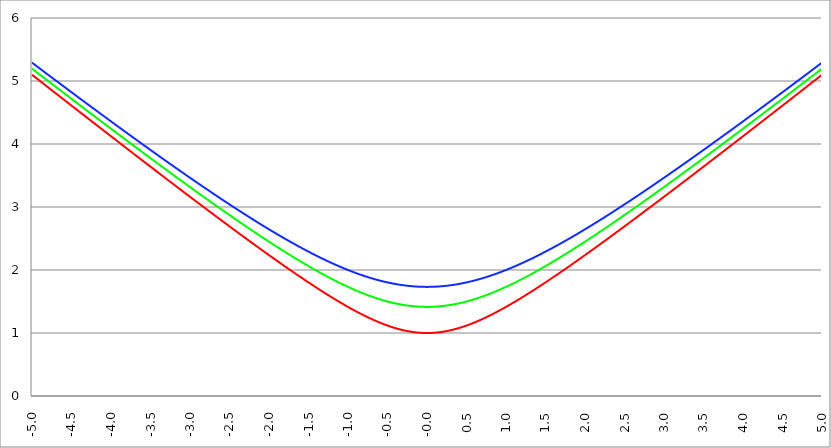
| Category | Series 1 | Series 0 | Series 2 |
|---|---|---|---|
| -5.0 | 5.099 | 5.196 | 5.292 |
| -4.995 | 5.094 | 5.191 | 5.287 |
| -4.99 | 5.089 | 5.187 | 5.282 |
| -4.985 | 5.084 | 5.182 | 5.277 |
| -4.98 | 5.079 | 5.177 | 5.273 |
| -4.975 | 5.075 | 5.172 | 5.268 |
| -4.97 | 5.07 | 5.167 | 5.263 |
| -4.965000000000001 | 5.065 | 5.162 | 5.258 |
| -4.960000000000001 | 5.06 | 5.158 | 5.254 |
| -4.955000000000001 | 5.055 | 5.153 | 5.249 |
| -4.950000000000001 | 5.05 | 5.148 | 5.244 |
| -4.945000000000001 | 5.045 | 5.143 | 5.24 |
| -4.940000000000001 | 5.04 | 5.138 | 5.235 |
| -4.935000000000001 | 5.035 | 5.134 | 5.23 |
| -4.930000000000001 | 5.03 | 5.129 | 5.225 |
| -4.925000000000002 | 5.025 | 5.124 | 5.221 |
| -4.920000000000002 | 5.021 | 5.119 | 5.216 |
| -4.915000000000002 | 5.016 | 5.114 | 5.211 |
| -4.910000000000002 | 5.011 | 5.11 | 5.207 |
| -4.905000000000002 | 5.006 | 5.105 | 5.202 |
| -4.900000000000002 | 5.001 | 5.1 | 5.197 |
| -4.895000000000002 | 4.996 | 5.095 | 5.192 |
| -4.890000000000002 | 4.991 | 5.09 | 5.188 |
| -4.885000000000002 | 4.986 | 5.086 | 5.183 |
| -4.880000000000002 | 4.981 | 5.081 | 5.178 |
| -4.875000000000003 | 4.977 | 5.076 | 5.174 |
| -4.870000000000003 | 4.972 | 5.071 | 5.169 |
| -4.865000000000003 | 4.967 | 5.066 | 5.164 |
| -4.860000000000003 | 4.962 | 5.062 | 5.159 |
| -4.855000000000003 | 4.957 | 5.057 | 5.155 |
| -4.850000000000003 | 4.952 | 5.052 | 5.15 |
| -4.845000000000003 | 4.947 | 5.047 | 5.145 |
| -4.840000000000003 | 4.942 | 5.042 | 5.141 |
| -4.835000000000003 | 4.937 | 5.038 | 5.136 |
| -4.830000000000004 | 4.932 | 5.033 | 5.131 |
| -4.825000000000004 | 4.928 | 5.028 | 5.126 |
| -4.820000000000004 | 4.923 | 5.023 | 5.122 |
| -4.815000000000004 | 4.918 | 5.018 | 5.117 |
| -4.810000000000004 | 4.913 | 5.014 | 5.112 |
| -4.805000000000004 | 4.908 | 5.009 | 5.108 |
| -4.800000000000004 | 4.903 | 5.004 | 5.103 |
| -4.795000000000004 | 4.898 | 4.999 | 5.098 |
| -4.790000000000004 | 4.893 | 4.994 | 5.094 |
| -4.785000000000004 | 4.888 | 4.99 | 5.089 |
| -4.780000000000004 | 4.883 | 4.985 | 5.084 |
| -4.775000000000004 | 4.879 | 4.98 | 5.079 |
| -4.770000000000004 | 4.874 | 4.975 | 5.075 |
| -4.765000000000005 | 4.869 | 4.97 | 5.07 |
| -4.760000000000005 | 4.864 | 4.966 | 5.065 |
| -4.755000000000005 | 4.859 | 4.961 | 5.061 |
| -4.750000000000005 | 4.854 | 4.956 | 5.056 |
| -4.745000000000005 | 4.849 | 4.951 | 5.051 |
| -4.740000000000005 | 4.844 | 4.946 | 5.047 |
| -4.735000000000005 | 4.839 | 4.942 | 5.042 |
| -4.730000000000005 | 4.835 | 4.937 | 5.037 |
| -4.725000000000006 | 4.83 | 4.932 | 5.032 |
| -4.720000000000006 | 4.825 | 4.927 | 5.028 |
| -4.715000000000006 | 4.82 | 4.923 | 5.023 |
| -4.710000000000006 | 4.815 | 4.918 | 5.018 |
| -4.705000000000006 | 4.81 | 4.913 | 5.014 |
| -4.700000000000006 | 4.805 | 4.908 | 5.009 |
| -4.695000000000006 | 4.8 | 4.903 | 5.004 |
| -4.690000000000006 | 4.795 | 4.899 | 5 |
| -4.685000000000007 | 4.791 | 4.894 | 4.995 |
| -4.680000000000007 | 4.786 | 4.889 | 4.99 |
| -4.675000000000007 | 4.781 | 4.884 | 4.986 |
| -4.670000000000007 | 4.776 | 4.879 | 4.981 |
| -4.665000000000007 | 4.771 | 4.875 | 4.976 |
| -4.660000000000007 | 4.766 | 4.87 | 4.971 |
| -4.655000000000007 | 4.761 | 4.865 | 4.967 |
| -4.650000000000007 | 4.756 | 4.86 | 4.962 |
| -4.645000000000007 | 4.751 | 4.856 | 4.957 |
| -4.640000000000008 | 4.747 | 4.851 | 4.953 |
| -4.635000000000008 | 4.742 | 4.846 | 4.948 |
| -4.630000000000008 | 4.737 | 4.841 | 4.943 |
| -4.625000000000008 | 4.732 | 4.836 | 4.939 |
| -4.620000000000008 | 4.727 | 4.832 | 4.934 |
| -4.615000000000008 | 4.722 | 4.827 | 4.929 |
| -4.610000000000008 | 4.717 | 4.822 | 4.925 |
| -4.605000000000008 | 4.712 | 4.817 | 4.92 |
| -4.600000000000008 | 4.707 | 4.812 | 4.915 |
| -4.595000000000009 | 4.703 | 4.808 | 4.911 |
| -4.590000000000009 | 4.698 | 4.803 | 4.906 |
| -4.585000000000009 | 4.693 | 4.798 | 4.901 |
| -4.580000000000009 | 4.688 | 4.793 | 4.897 |
| -4.57500000000001 | 4.683 | 4.789 | 4.892 |
| -4.57000000000001 | 4.678 | 4.784 | 4.887 |
| -4.565000000000009 | 4.673 | 4.779 | 4.883 |
| -4.560000000000009 | 4.668 | 4.774 | 4.878 |
| -4.555000000000009 | 4.663 | 4.769 | 4.873 |
| -4.55000000000001 | 4.659 | 4.765 | 4.869 |
| -4.54500000000001 | 4.654 | 4.76 | 4.864 |
| -4.54000000000001 | 4.649 | 4.755 | 4.859 |
| -4.53500000000001 | 4.644 | 4.75 | 4.855 |
| -4.53000000000001 | 4.639 | 4.746 | 4.85 |
| -4.52500000000001 | 4.634 | 4.741 | 4.845 |
| -4.52000000000001 | 4.629 | 4.736 | 4.84 |
| -4.51500000000001 | 4.624 | 4.731 | 4.836 |
| -4.51000000000001 | 4.62 | 4.727 | 4.831 |
| -4.505000000000011 | 4.615 | 4.722 | 4.826 |
| -4.500000000000011 | 4.61 | 4.717 | 4.822 |
| -4.495000000000011 | 4.605 | 4.712 | 4.817 |
| -4.490000000000011 | 4.6 | 4.707 | 4.812 |
| -4.485000000000011 | 4.595 | 4.703 | 4.808 |
| -4.480000000000011 | 4.59 | 4.698 | 4.803 |
| -4.475000000000011 | 4.585 | 4.693 | 4.799 |
| -4.470000000000011 | 4.58 | 4.688 | 4.794 |
| -4.465000000000011 | 4.576 | 4.684 | 4.789 |
| -4.460000000000011 | 4.571 | 4.679 | 4.785 |
| -4.455000000000012 | 4.566 | 4.674 | 4.78 |
| -4.450000000000012 | 4.561 | 4.669 | 4.775 |
| -4.445000000000012 | 4.556 | 4.665 | 4.771 |
| -4.440000000000012 | 4.551 | 4.66 | 4.766 |
| -4.435000000000012 | 4.546 | 4.655 | 4.761 |
| -4.430000000000012 | 4.541 | 4.65 | 4.757 |
| -4.425000000000012 | 4.537 | 4.645 | 4.752 |
| -4.420000000000012 | 4.532 | 4.641 | 4.747 |
| -4.415000000000012 | 4.527 | 4.636 | 4.743 |
| -4.410000000000013 | 4.522 | 4.631 | 4.738 |
| -4.405000000000013 | 4.517 | 4.626 | 4.733 |
| -4.400000000000013 | 4.512 | 4.622 | 4.729 |
| -4.395000000000013 | 4.507 | 4.617 | 4.724 |
| -4.390000000000013 | 4.502 | 4.612 | 4.719 |
| -4.385000000000013 | 4.498 | 4.607 | 4.715 |
| -4.380000000000013 | 4.493 | 4.603 | 4.71 |
| -4.375000000000013 | 4.488 | 4.598 | 4.705 |
| -4.370000000000013 | 4.483 | 4.593 | 4.701 |
| -4.365000000000013 | 4.478 | 4.588 | 4.696 |
| -4.360000000000014 | 4.473 | 4.584 | 4.691 |
| -4.355000000000014 | 4.468 | 4.579 | 4.687 |
| -4.350000000000014 | 4.463 | 4.574 | 4.682 |
| -4.345000000000014 | 4.459 | 4.569 | 4.678 |
| -4.340000000000014 | 4.454 | 4.565 | 4.673 |
| -4.335000000000014 | 4.449 | 4.56 | 4.668 |
| -4.330000000000014 | 4.444 | 4.555 | 4.664 |
| -4.325000000000014 | 4.439 | 4.55 | 4.659 |
| -4.320000000000014 | 4.434 | 4.546 | 4.654 |
| -4.315000000000015 | 4.429 | 4.541 | 4.65 |
| -4.310000000000015 | 4.424 | 4.536 | 4.645 |
| -4.305000000000015 | 4.42 | 4.531 | 4.64 |
| -4.300000000000015 | 4.415 | 4.527 | 4.636 |
| -4.295000000000015 | 4.41 | 4.522 | 4.631 |
| -4.290000000000015 | 4.405 | 4.517 | 4.626 |
| -4.285000000000015 | 4.4 | 4.512 | 4.622 |
| -4.280000000000015 | 4.395 | 4.508 | 4.617 |
| -4.275000000000015 | 4.39 | 4.503 | 4.613 |
| -4.270000000000015 | 4.386 | 4.498 | 4.608 |
| -4.265000000000016 | 4.381 | 4.493 | 4.603 |
| -4.260000000000016 | 4.376 | 4.489 | 4.599 |
| -4.255000000000016 | 4.371 | 4.484 | 4.594 |
| -4.250000000000016 | 4.366 | 4.479 | 4.589 |
| -4.245000000000016 | 4.361 | 4.474 | 4.585 |
| -4.240000000000016 | 4.356 | 4.47 | 4.58 |
| -4.235000000000016 | 4.351 | 4.465 | 4.576 |
| -4.230000000000016 | 4.347 | 4.46 | 4.571 |
| -4.225000000000017 | 4.342 | 4.455 | 4.566 |
| -4.220000000000017 | 4.337 | 4.451 | 4.562 |
| -4.215000000000017 | 4.332 | 4.446 | 4.557 |
| -4.210000000000017 | 4.327 | 4.441 | 4.552 |
| -4.205000000000017 | 4.322 | 4.436 | 4.548 |
| -4.200000000000017 | 4.317 | 4.432 | 4.543 |
| -4.195000000000017 | 4.313 | 4.427 | 4.539 |
| -4.190000000000017 | 4.308 | 4.422 | 4.534 |
| -4.185000000000017 | 4.303 | 4.417 | 4.529 |
| -4.180000000000017 | 4.298 | 4.413 | 4.525 |
| -4.175000000000018 | 4.293 | 4.408 | 4.52 |
| -4.170000000000018 | 4.288 | 4.403 | 4.515 |
| -4.165000000000018 | 4.283 | 4.399 | 4.511 |
| -4.160000000000018 | 4.279 | 4.394 | 4.506 |
| -4.155000000000018 | 4.274 | 4.389 | 4.502 |
| -4.150000000000018 | 4.269 | 4.384 | 4.497 |
| -4.145000000000018 | 4.264 | 4.38 | 4.492 |
| -4.140000000000018 | 4.259 | 4.375 | 4.488 |
| -4.135000000000018 | 4.254 | 4.37 | 4.483 |
| -4.130000000000019 | 4.249 | 4.365 | 4.478 |
| -4.125000000000019 | 4.244 | 4.361 | 4.474 |
| -4.120000000000019 | 4.24 | 4.356 | 4.469 |
| -4.115000000000019 | 4.235 | 4.351 | 4.465 |
| -4.110000000000019 | 4.23 | 4.347 | 4.46 |
| -4.105000000000019 | 4.225 | 4.342 | 4.455 |
| -4.100000000000019 | 4.22 | 4.337 | 4.451 |
| -4.095000000000019 | 4.215 | 4.332 | 4.446 |
| -4.090000000000019 | 4.21 | 4.328 | 4.442 |
| -4.085000000000019 | 4.206 | 4.323 | 4.437 |
| -4.08000000000002 | 4.201 | 4.318 | 4.432 |
| -4.07500000000002 | 4.196 | 4.313 | 4.428 |
| -4.07000000000002 | 4.191 | 4.309 | 4.423 |
| -4.06500000000002 | 4.186 | 4.304 | 4.419 |
| -4.06000000000002 | 4.181 | 4.299 | 4.414 |
| -4.05500000000002 | 4.176 | 4.295 | 4.409 |
| -4.05000000000002 | 4.172 | 4.29 | 4.405 |
| -4.04500000000002 | 4.167 | 4.285 | 4.4 |
| -4.04000000000002 | 4.162 | 4.28 | 4.396 |
| -4.03500000000002 | 4.157 | 4.276 | 4.391 |
| -4.03000000000002 | 4.152 | 4.271 | 4.386 |
| -4.025000000000021 | 4.147 | 4.266 | 4.382 |
| -4.020000000000021 | 4.143 | 4.262 | 4.377 |
| -4.015000000000021 | 4.138 | 4.257 | 4.373 |
| -4.010000000000021 | 4.133 | 4.252 | 4.368 |
| -4.005000000000021 | 4.128 | 4.247 | 4.363 |
| -4.000000000000021 | 4.123 | 4.243 | 4.359 |
| -3.995000000000021 | 4.118 | 4.238 | 4.354 |
| -3.990000000000021 | 4.113 | 4.233 | 4.35 |
| -3.985000000000022 | 4.109 | 4.229 | 4.345 |
| -3.980000000000022 | 4.104 | 4.224 | 4.341 |
| -3.975000000000022 | 4.099 | 4.219 | 4.336 |
| -3.970000000000022 | 4.094 | 4.214 | 4.331 |
| -3.965000000000022 | 4.089 | 4.21 | 4.327 |
| -3.960000000000022 | 4.084 | 4.205 | 4.322 |
| -3.955000000000022 | 4.079 | 4.2 | 4.318 |
| -3.950000000000022 | 4.075 | 4.196 | 4.313 |
| -3.945000000000022 | 4.07 | 4.191 | 4.308 |
| -3.940000000000023 | 4.065 | 4.186 | 4.304 |
| -3.935000000000023 | 4.06 | 4.181 | 4.299 |
| -3.930000000000023 | 4.055 | 4.177 | 4.295 |
| -3.925000000000023 | 4.05 | 4.172 | 4.29 |
| -3.920000000000023 | 4.046 | 4.167 | 4.286 |
| -3.915000000000023 | 4.041 | 4.163 | 4.281 |
| -3.910000000000023 | 4.036 | 4.158 | 4.276 |
| -3.905000000000023 | 4.031 | 4.153 | 4.272 |
| -3.900000000000023 | 4.026 | 4.148 | 4.267 |
| -3.895000000000023 | 4.021 | 4.144 | 4.263 |
| -3.890000000000024 | 4.016 | 4.139 | 4.258 |
| -3.885000000000024 | 4.012 | 4.134 | 4.254 |
| -3.880000000000024 | 4.007 | 4.13 | 4.249 |
| -3.875000000000024 | 4.002 | 4.125 | 4.244 |
| -3.870000000000024 | 3.997 | 4.12 | 4.24 |
| -3.865000000000024 | 3.992 | 4.116 | 4.235 |
| -3.860000000000024 | 3.987 | 4.111 | 4.231 |
| -3.855000000000024 | 3.983 | 4.106 | 4.226 |
| -3.850000000000024 | 3.978 | 4.102 | 4.222 |
| -3.845000000000025 | 3.973 | 4.097 | 4.217 |
| -3.840000000000025 | 3.968 | 4.092 | 4.213 |
| -3.835000000000025 | 3.963 | 4.087 | 4.208 |
| -3.830000000000025 | 3.958 | 4.083 | 4.203 |
| -3.825000000000025 | 3.954 | 4.078 | 4.199 |
| -3.820000000000025 | 3.949 | 4.073 | 4.194 |
| -3.815000000000025 | 3.944 | 4.069 | 4.19 |
| -3.810000000000025 | 3.939 | 4.064 | 4.185 |
| -3.805000000000025 | 3.934 | 4.059 | 4.181 |
| -3.800000000000026 | 3.929 | 4.055 | 4.176 |
| -3.795000000000026 | 3.925 | 4.05 | 4.172 |
| -3.790000000000026 | 3.92 | 4.045 | 4.167 |
| -3.785000000000026 | 3.915 | 4.041 | 4.162 |
| -3.780000000000026 | 3.91 | 4.036 | 4.158 |
| -3.775000000000026 | 3.905 | 4.031 | 4.153 |
| -3.770000000000026 | 3.9 | 4.027 | 4.149 |
| -3.765000000000026 | 3.896 | 4.022 | 4.144 |
| -3.760000000000026 | 3.891 | 4.017 | 4.14 |
| -3.755000000000026 | 3.886 | 4.012 | 4.135 |
| -3.750000000000027 | 3.881 | 4.008 | 4.131 |
| -3.745000000000027 | 3.876 | 4.003 | 4.126 |
| -3.740000000000027 | 3.871 | 3.998 | 4.122 |
| -3.735000000000027 | 3.867 | 3.994 | 4.117 |
| -3.730000000000027 | 3.862 | 3.989 | 4.113 |
| -3.725000000000027 | 3.857 | 3.984 | 4.108 |
| -3.720000000000027 | 3.852 | 3.98 | 4.103 |
| -3.715000000000027 | 3.847 | 3.975 | 4.099 |
| -3.710000000000027 | 3.842 | 3.97 | 4.094 |
| -3.705000000000028 | 3.838 | 3.966 | 4.09 |
| -3.700000000000028 | 3.833 | 3.961 | 4.085 |
| -3.695000000000028 | 3.828 | 3.956 | 4.081 |
| -3.690000000000028 | 3.823 | 3.952 | 4.076 |
| -3.685000000000028 | 3.818 | 3.947 | 4.072 |
| -3.680000000000028 | 3.813 | 3.942 | 4.067 |
| -3.675000000000028 | 3.809 | 3.938 | 4.063 |
| -3.670000000000028 | 3.804 | 3.933 | 4.058 |
| -3.665000000000028 | 3.799 | 3.928 | 4.054 |
| -3.660000000000028 | 3.794 | 3.924 | 4.049 |
| -3.655000000000029 | 3.789 | 3.919 | 4.045 |
| -3.650000000000029 | 3.785 | 3.914 | 4.04 |
| -3.645000000000029 | 3.78 | 3.91 | 4.036 |
| -3.640000000000029 | 3.775 | 3.905 | 4.031 |
| -3.635000000000029 | 3.77 | 3.9 | 4.027 |
| -3.630000000000029 | 3.765 | 3.896 | 4.022 |
| -3.625000000000029 | 3.76 | 3.891 | 4.018 |
| -3.620000000000029 | 3.756 | 3.886 | 4.013 |
| -3.615000000000029 | 3.751 | 3.882 | 4.009 |
| -3.61000000000003 | 3.746 | 3.877 | 4.004 |
| -3.60500000000003 | 3.741 | 3.872 | 4 |
| -3.60000000000003 | 3.736 | 3.868 | 3.995 |
| -3.59500000000003 | 3.731 | 3.863 | 3.99 |
| -3.59000000000003 | 3.727 | 3.859 | 3.986 |
| -3.58500000000003 | 3.722 | 3.854 | 3.981 |
| -3.58000000000003 | 3.717 | 3.849 | 3.977 |
| -3.57500000000003 | 3.712 | 3.845 | 3.972 |
| -3.57000000000003 | 3.707 | 3.84 | 3.968 |
| -3.565000000000031 | 3.703 | 3.835 | 3.963 |
| -3.560000000000031 | 3.698 | 3.831 | 3.959 |
| -3.555000000000031 | 3.693 | 3.826 | 3.954 |
| -3.550000000000031 | 3.688 | 3.821 | 3.95 |
| -3.545000000000031 | 3.683 | 3.817 | 3.946 |
| -3.540000000000031 | 3.679 | 3.812 | 3.941 |
| -3.535000000000031 | 3.674 | 3.807 | 3.937 |
| -3.530000000000031 | 3.669 | 3.803 | 3.932 |
| -3.525000000000031 | 3.664 | 3.798 | 3.928 |
| -3.520000000000032 | 3.659 | 3.793 | 3.923 |
| -3.515000000000032 | 3.654 | 3.789 | 3.919 |
| -3.510000000000032 | 3.65 | 3.784 | 3.914 |
| -3.505000000000032 | 3.645 | 3.78 | 3.91 |
| -3.500000000000032 | 3.64 | 3.775 | 3.905 |
| -3.495000000000032 | 3.635 | 3.77 | 3.901 |
| -3.490000000000032 | 3.63 | 3.766 | 3.896 |
| -3.485000000000032 | 3.626 | 3.761 | 3.892 |
| -3.480000000000032 | 3.621 | 3.756 | 3.887 |
| -3.475000000000032 | 3.616 | 3.752 | 3.883 |
| -3.470000000000033 | 3.611 | 3.747 | 3.878 |
| -3.465000000000033 | 3.606 | 3.742 | 3.874 |
| -3.460000000000033 | 3.602 | 3.738 | 3.869 |
| -3.455000000000033 | 3.597 | 3.733 | 3.865 |
| -3.450000000000033 | 3.592 | 3.729 | 3.86 |
| -3.445000000000033 | 3.587 | 3.724 | 3.856 |
| -3.440000000000033 | 3.582 | 3.719 | 3.851 |
| -3.435000000000033 | 3.578 | 3.715 | 3.847 |
| -3.430000000000033 | 3.573 | 3.71 | 3.843 |
| -3.425000000000034 | 3.568 | 3.705 | 3.838 |
| -3.420000000000034 | 3.563 | 3.701 | 3.834 |
| -3.415000000000034 | 3.558 | 3.696 | 3.829 |
| -3.410000000000034 | 3.554 | 3.692 | 3.825 |
| -3.405000000000034 | 3.549 | 3.687 | 3.82 |
| -3.400000000000034 | 3.544 | 3.682 | 3.816 |
| -3.395000000000034 | 3.539 | 3.678 | 3.811 |
| -3.390000000000034 | 3.534 | 3.673 | 3.807 |
| -3.385000000000034 | 3.53 | 3.669 | 3.802 |
| -3.380000000000034 | 3.525 | 3.664 | 3.798 |
| -3.375000000000035 | 3.52 | 3.659 | 3.793 |
| -3.370000000000035 | 3.515 | 3.655 | 3.789 |
| -3.365000000000035 | 3.51 | 3.65 | 3.785 |
| -3.360000000000035 | 3.506 | 3.645 | 3.78 |
| -3.355000000000035 | 3.501 | 3.641 | 3.776 |
| -3.350000000000035 | 3.496 | 3.636 | 3.771 |
| -3.345000000000035 | 3.491 | 3.632 | 3.767 |
| -3.340000000000035 | 3.486 | 3.627 | 3.762 |
| -3.335000000000035 | 3.482 | 3.622 | 3.758 |
| -3.330000000000036 | 3.477 | 3.618 | 3.754 |
| -3.325000000000036 | 3.472 | 3.613 | 3.749 |
| -3.320000000000036 | 3.467 | 3.609 | 3.745 |
| -3.315000000000036 | 3.463 | 3.604 | 3.74 |
| -3.310000000000036 | 3.458 | 3.599 | 3.736 |
| -3.305000000000036 | 3.453 | 3.595 | 3.731 |
| -3.300000000000036 | 3.448 | 3.59 | 3.727 |
| -3.295000000000036 | 3.443 | 3.586 | 3.723 |
| -3.290000000000036 | 3.439 | 3.581 | 3.718 |
| -3.285000000000036 | 3.434 | 3.576 | 3.714 |
| -3.280000000000036 | 3.429 | 3.572 | 3.709 |
| -3.275000000000037 | 3.424 | 3.567 | 3.705 |
| -3.270000000000037 | 3.419 | 3.563 | 3.7 |
| -3.265000000000037 | 3.415 | 3.558 | 3.696 |
| -3.260000000000037 | 3.41 | 3.554 | 3.692 |
| -3.255000000000037 | 3.405 | 3.549 | 3.687 |
| -3.250000000000037 | 3.4 | 3.544 | 3.683 |
| -3.245000000000037 | 3.396 | 3.54 | 3.678 |
| -3.240000000000037 | 3.391 | 3.535 | 3.674 |
| -3.235000000000038 | 3.386 | 3.531 | 3.669 |
| -3.230000000000038 | 3.381 | 3.526 | 3.665 |
| -3.225000000000038 | 3.376 | 3.521 | 3.661 |
| -3.220000000000038 | 3.372 | 3.517 | 3.656 |
| -3.215000000000038 | 3.367 | 3.512 | 3.652 |
| -3.210000000000038 | 3.362 | 3.508 | 3.647 |
| -3.205000000000038 | 3.357 | 3.503 | 3.643 |
| -3.200000000000038 | 3.353 | 3.499 | 3.639 |
| -3.195000000000038 | 3.348 | 3.494 | 3.634 |
| -3.190000000000039 | 3.343 | 3.489 | 3.63 |
| -3.185000000000039 | 3.338 | 3.485 | 3.625 |
| -3.180000000000039 | 3.334 | 3.48 | 3.621 |
| -3.175000000000039 | 3.329 | 3.476 | 3.617 |
| -3.170000000000039 | 3.324 | 3.471 | 3.612 |
| -3.16500000000004 | 3.319 | 3.467 | 3.608 |
| -3.16000000000004 | 3.314 | 3.462 | 3.604 |
| -3.155000000000039 | 3.31 | 3.457 | 3.599 |
| -3.150000000000039 | 3.305 | 3.453 | 3.595 |
| -3.14500000000004 | 3.3 | 3.448 | 3.59 |
| -3.14000000000004 | 3.295 | 3.444 | 3.586 |
| -3.13500000000004 | 3.291 | 3.439 | 3.582 |
| -3.13000000000004 | 3.286 | 3.435 | 3.577 |
| -3.12500000000004 | 3.281 | 3.43 | 3.573 |
| -3.12000000000004 | 3.276 | 3.426 | 3.569 |
| -3.11500000000004 | 3.272 | 3.421 | 3.564 |
| -3.11000000000004 | 3.267 | 3.416 | 3.56 |
| -3.10500000000004 | 3.262 | 3.412 | 3.555 |
| -3.10000000000004 | 3.257 | 3.407 | 3.551 |
| -3.095000000000041 | 3.253 | 3.403 | 3.547 |
| -3.090000000000041 | 3.248 | 3.398 | 3.542 |
| -3.085000000000041 | 3.243 | 3.394 | 3.538 |
| -3.080000000000041 | 3.238 | 3.389 | 3.534 |
| -3.075000000000041 | 3.234 | 3.385 | 3.529 |
| -3.070000000000041 | 3.229 | 3.38 | 3.525 |
| -3.065000000000041 | 3.224 | 3.376 | 3.521 |
| -3.060000000000041 | 3.219 | 3.371 | 3.516 |
| -3.055000000000041 | 3.215 | 3.366 | 3.512 |
| -3.050000000000042 | 3.21 | 3.362 | 3.507 |
| -3.045000000000042 | 3.205 | 3.357 | 3.503 |
| -3.040000000000042 | 3.2 | 3.353 | 3.499 |
| -3.035000000000042 | 3.196 | 3.348 | 3.494 |
| -3.030000000000042 | 3.191 | 3.344 | 3.49 |
| -3.025000000000042 | 3.186 | 3.339 | 3.486 |
| -3.020000000000042 | 3.181 | 3.335 | 3.481 |
| -3.015000000000042 | 3.177 | 3.33 | 3.477 |
| -3.010000000000042 | 3.172 | 3.326 | 3.473 |
| -3.005000000000043 | 3.167 | 3.321 | 3.468 |
| -3.000000000000043 | 3.162 | 3.317 | 3.464 |
| -2.995000000000043 | 3.158 | 3.312 | 3.46 |
| -2.990000000000043 | 3.153 | 3.308 | 3.455 |
| -2.985000000000043 | 3.148 | 3.303 | 3.451 |
| -2.980000000000043 | 3.143 | 3.299 | 3.447 |
| -2.975000000000043 | 3.139 | 3.294 | 3.442 |
| -2.970000000000043 | 3.134 | 3.29 | 3.438 |
| -2.965000000000043 | 3.129 | 3.285 | 3.434 |
| -2.960000000000043 | 3.124 | 3.28 | 3.43 |
| -2.955000000000044 | 3.12 | 3.276 | 3.425 |
| -2.950000000000044 | 3.115 | 3.271 | 3.421 |
| -2.945000000000044 | 3.11 | 3.267 | 3.417 |
| -2.940000000000044 | 3.105 | 3.262 | 3.412 |
| -2.935000000000044 | 3.101 | 3.258 | 3.408 |
| -2.930000000000044 | 3.096 | 3.253 | 3.404 |
| -2.925000000000044 | 3.091 | 3.249 | 3.399 |
| -2.920000000000044 | 3.086 | 3.244 | 3.395 |
| -2.915000000000044 | 3.082 | 3.24 | 3.391 |
| -2.910000000000045 | 3.077 | 3.235 | 3.386 |
| -2.905000000000045 | 3.072 | 3.231 | 3.382 |
| -2.900000000000045 | 3.068 | 3.226 | 3.378 |
| -2.895000000000045 | 3.063 | 3.222 | 3.374 |
| -2.890000000000045 | 3.058 | 3.217 | 3.369 |
| -2.885000000000045 | 3.053 | 3.213 | 3.365 |
| -2.880000000000045 | 3.049 | 3.208 | 3.361 |
| -2.875000000000045 | 3.044 | 3.204 | 3.356 |
| -2.870000000000045 | 3.039 | 3.2 | 3.352 |
| -2.865000000000045 | 3.035 | 3.195 | 3.348 |
| -2.860000000000046 | 3.03 | 3.191 | 3.344 |
| -2.855000000000046 | 3.025 | 3.186 | 3.339 |
| -2.850000000000046 | 3.02 | 3.182 | 3.335 |
| -2.845000000000046 | 3.016 | 3.177 | 3.331 |
| -2.840000000000046 | 3.011 | 3.173 | 3.326 |
| -2.835000000000046 | 3.006 | 3.168 | 3.322 |
| -2.830000000000046 | 3.001 | 3.164 | 3.318 |
| -2.825000000000046 | 2.997 | 3.159 | 3.314 |
| -2.820000000000046 | 2.992 | 3.155 | 3.309 |
| -2.815000000000047 | 2.987 | 3.15 | 3.305 |
| -2.810000000000047 | 2.983 | 3.146 | 3.301 |
| -2.805000000000047 | 2.978 | 3.141 | 3.297 |
| -2.800000000000047 | 2.973 | 3.137 | 3.292 |
| -2.795000000000047 | 2.969 | 3.132 | 3.288 |
| -2.790000000000047 | 2.964 | 3.128 | 3.284 |
| -2.785000000000047 | 2.959 | 3.123 | 3.28 |
| -2.780000000000047 | 2.954 | 3.119 | 3.275 |
| -2.775000000000047 | 2.95 | 3.115 | 3.271 |
| -2.770000000000047 | 2.945 | 3.11 | 3.267 |
| -2.765000000000048 | 2.94 | 3.106 | 3.263 |
| -2.760000000000048 | 2.936 | 3.101 | 3.258 |
| -2.755000000000048 | 2.931 | 3.097 | 3.254 |
| -2.750000000000048 | 2.926 | 3.092 | 3.25 |
| -2.745000000000048 | 2.921 | 3.088 | 3.246 |
| -2.740000000000048 | 2.917 | 3.083 | 3.242 |
| -2.735000000000048 | 2.912 | 3.079 | 3.237 |
| -2.730000000000048 | 2.907 | 3.075 | 3.233 |
| -2.725000000000048 | 2.903 | 3.07 | 3.229 |
| -2.720000000000049 | 2.898 | 3.066 | 3.225 |
| -2.715000000000049 | 2.893 | 3.061 | 3.22 |
| -2.710000000000049 | 2.889 | 3.057 | 3.216 |
| -2.705000000000049 | 2.884 | 3.052 | 3.212 |
| -2.700000000000049 | 2.879 | 3.048 | 3.208 |
| -2.695000000000049 | 2.875 | 3.044 | 3.204 |
| -2.690000000000049 | 2.87 | 3.039 | 3.199 |
| -2.685000000000049 | 2.865 | 3.035 | 3.195 |
| -2.680000000000049 | 2.86 | 3.03 | 3.191 |
| -2.675000000000049 | 2.856 | 3.026 | 3.187 |
| -2.67000000000005 | 2.851 | 3.021 | 3.183 |
| -2.66500000000005 | 2.846 | 3.017 | 3.178 |
| -2.66000000000005 | 2.842 | 3.013 | 3.174 |
| -2.65500000000005 | 2.837 | 3.008 | 3.17 |
| -2.65000000000005 | 2.832 | 3.004 | 3.166 |
| -2.64500000000005 | 2.828 | 2.999 | 3.162 |
| -2.64000000000005 | 2.823 | 2.995 | 3.157 |
| -2.63500000000005 | 2.818 | 2.991 | 3.153 |
| -2.63000000000005 | 2.814 | 2.986 | 3.149 |
| -2.625000000000051 | 2.809 | 2.982 | 3.145 |
| -2.620000000000051 | 2.804 | 2.977 | 3.141 |
| -2.615000000000051 | 2.8 | 2.973 | 3.137 |
| -2.610000000000051 | 2.795 | 2.969 | 3.132 |
| -2.605000000000051 | 2.79 | 2.964 | 3.128 |
| -2.600000000000051 | 2.786 | 2.96 | 3.124 |
| -2.595000000000051 | 2.781 | 2.955 | 3.12 |
| -2.590000000000051 | 2.776 | 2.951 | 3.116 |
| -2.585000000000051 | 2.772 | 2.947 | 3.112 |
| -2.580000000000052 | 2.767 | 2.942 | 3.107 |
| -2.575000000000052 | 2.762 | 2.938 | 3.103 |
| -2.570000000000052 | 2.758 | 2.933 | 3.099 |
| -2.565000000000052 | 2.753 | 2.929 | 3.095 |
| -2.560000000000052 | 2.748 | 2.925 | 3.091 |
| -2.555000000000052 | 2.744 | 2.92 | 3.087 |
| -2.550000000000052 | 2.739 | 2.916 | 3.083 |
| -2.545000000000052 | 2.734 | 2.912 | 3.078 |
| -2.540000000000052 | 2.73 | 2.907 | 3.074 |
| -2.535000000000053 | 2.725 | 2.903 | 3.07 |
| -2.530000000000053 | 2.72 | 2.898 | 3.066 |
| -2.525000000000053 | 2.716 | 2.894 | 3.062 |
| -2.520000000000053 | 2.711 | 2.89 | 3.058 |
| -2.515000000000053 | 2.707 | 2.885 | 3.054 |
| -2.510000000000053 | 2.702 | 2.881 | 3.05 |
| -2.505000000000053 | 2.697 | 2.877 | 3.045 |
| -2.500000000000053 | 2.693 | 2.872 | 3.041 |
| -2.495000000000053 | 2.688 | 2.868 | 3.037 |
| -2.490000000000053 | 2.683 | 2.864 | 3.033 |
| -2.485000000000054 | 2.679 | 2.859 | 3.029 |
| -2.480000000000054 | 2.674 | 2.855 | 3.025 |
| -2.475000000000054 | 2.669 | 2.851 | 3.021 |
| -2.470000000000054 | 2.665 | 2.846 | 3.017 |
| -2.465000000000054 | 2.66 | 2.842 | 3.013 |
| -2.460000000000054 | 2.655 | 2.838 | 3.009 |
| -2.455000000000054 | 2.651 | 2.833 | 3.005 |
| -2.450000000000054 | 2.646 | 2.829 | 3 |
| -2.445000000000054 | 2.642 | 2.825 | 2.996 |
| -2.440000000000055 | 2.637 | 2.82 | 2.992 |
| -2.435000000000055 | 2.632 | 2.816 | 2.988 |
| -2.430000000000055 | 2.628 | 2.812 | 2.984 |
| -2.425000000000055 | 2.623 | 2.807 | 2.98 |
| -2.420000000000055 | 2.618 | 2.803 | 2.976 |
| -2.415000000000055 | 2.614 | 2.799 | 2.972 |
| -2.410000000000055 | 2.609 | 2.794 | 2.968 |
| -2.405000000000055 | 2.605 | 2.79 | 2.964 |
| -2.400000000000055 | 2.6 | 2.786 | 2.96 |
| -2.395000000000055 | 2.595 | 2.781 | 2.956 |
| -2.390000000000056 | 2.591 | 2.777 | 2.952 |
| -2.385000000000056 | 2.586 | 2.773 | 2.948 |
| -2.380000000000056 | 2.582 | 2.768 | 2.944 |
| -2.375000000000056 | 2.577 | 2.764 | 2.939 |
| -2.370000000000056 | 2.572 | 2.76 | 2.935 |
| -2.365000000000056 | 2.568 | 2.756 | 2.931 |
| -2.360000000000056 | 2.563 | 2.751 | 2.927 |
| -2.355000000000056 | 2.559 | 2.747 | 2.923 |
| -2.350000000000056 | 2.554 | 2.743 | 2.919 |
| -2.345000000000057 | 2.549 | 2.738 | 2.915 |
| -2.340000000000057 | 2.545 | 2.734 | 2.911 |
| -2.335000000000057 | 2.54 | 2.73 | 2.907 |
| -2.330000000000057 | 2.536 | 2.726 | 2.903 |
| -2.325000000000057 | 2.531 | 2.721 | 2.899 |
| -2.320000000000057 | 2.526 | 2.717 | 2.895 |
| -2.315000000000057 | 2.522 | 2.713 | 2.891 |
| -2.310000000000057 | 2.517 | 2.709 | 2.887 |
| -2.305000000000057 | 2.513 | 2.704 | 2.883 |
| -2.300000000000058 | 2.508 | 2.7 | 2.879 |
| -2.295000000000058 | 2.503 | 2.696 | 2.875 |
| -2.290000000000058 | 2.499 | 2.691 | 2.871 |
| -2.285000000000058 | 2.494 | 2.687 | 2.867 |
| -2.280000000000058 | 2.49 | 2.683 | 2.863 |
| -2.275000000000058 | 2.485 | 2.679 | 2.859 |
| -2.270000000000058 | 2.481 | 2.674 | 2.855 |
| -2.265000000000058 | 2.476 | 2.67 | 2.851 |
| -2.260000000000058 | 2.471 | 2.666 | 2.847 |
| -2.255000000000058 | 2.467 | 2.662 | 2.843 |
| -2.250000000000059 | 2.462 | 2.658 | 2.839 |
| -2.245000000000059 | 2.458 | 2.653 | 2.835 |
| -2.240000000000059 | 2.453 | 2.649 | 2.832 |
| -2.235000000000059 | 2.449 | 2.645 | 2.828 |
| -2.23000000000006 | 2.444 | 2.641 | 2.824 |
| -2.22500000000006 | 2.439 | 2.636 | 2.82 |
| -2.22000000000006 | 2.435 | 2.632 | 2.816 |
| -2.215000000000059 | 2.43 | 2.628 | 2.812 |
| -2.210000000000059 | 2.426 | 2.624 | 2.808 |
| -2.20500000000006 | 2.421 | 2.62 | 2.804 |
| -2.20000000000006 | 2.417 | 2.615 | 2.8 |
| -2.19500000000006 | 2.412 | 2.611 | 2.796 |
| -2.19000000000006 | 2.408 | 2.607 | 2.792 |
| -2.18500000000006 | 2.403 | 2.603 | 2.788 |
| -2.18000000000006 | 2.398 | 2.599 | 2.784 |
| -2.17500000000006 | 2.394 | 2.594 | 2.78 |
| -2.17000000000006 | 2.389 | 2.59 | 2.776 |
| -2.16500000000006 | 2.385 | 2.586 | 2.773 |
| -2.160000000000061 | 2.38 | 2.582 | 2.769 |
| -2.155000000000061 | 2.376 | 2.578 | 2.765 |
| -2.150000000000061 | 2.371 | 2.573 | 2.761 |
| -2.145000000000061 | 2.367 | 2.569 | 2.757 |
| -2.140000000000061 | 2.362 | 2.565 | 2.753 |
| -2.135000000000061 | 2.358 | 2.561 | 2.749 |
| -2.130000000000061 | 2.353 | 2.557 | 2.745 |
| -2.125000000000061 | 2.349 | 2.553 | 2.741 |
| -2.120000000000061 | 2.344 | 2.548 | 2.738 |
| -2.115000000000061 | 2.339 | 2.544 | 2.734 |
| -2.110000000000062 | 2.335 | 2.54 | 2.73 |
| -2.105000000000062 | 2.33 | 2.536 | 2.726 |
| -2.100000000000062 | 2.326 | 2.532 | 2.722 |
| -2.095000000000062 | 2.321 | 2.528 | 2.718 |
| -2.090000000000062 | 2.317 | 2.524 | 2.714 |
| -2.085000000000062 | 2.312 | 2.519 | 2.711 |
| -2.080000000000062 | 2.308 | 2.515 | 2.707 |
| -2.075000000000062 | 2.303 | 2.511 | 2.703 |
| -2.070000000000062 | 2.299 | 2.507 | 2.699 |
| -2.065000000000063 | 2.294 | 2.503 | 2.695 |
| -2.060000000000063 | 2.29 | 2.499 | 2.691 |
| -2.055000000000063 | 2.285 | 2.495 | 2.688 |
| -2.050000000000063 | 2.281 | 2.49 | 2.684 |
| -2.045000000000063 | 2.276 | 2.486 | 2.68 |
| -2.040000000000063 | 2.272 | 2.482 | 2.676 |
| -2.035000000000063 | 2.267 | 2.478 | 2.672 |
| -2.030000000000063 | 2.263 | 2.474 | 2.669 |
| -2.025000000000063 | 2.258 | 2.47 | 2.665 |
| -2.020000000000064 | 2.254 | 2.466 | 2.661 |
| -2.015000000000064 | 2.249 | 2.462 | 2.657 |
| -2.010000000000064 | 2.245 | 2.458 | 2.653 |
| -2.005000000000064 | 2.241 | 2.454 | 2.65 |
| -2.000000000000064 | 2.236 | 2.449 | 2.646 |
| -1.995000000000064 | 2.232 | 2.445 | 2.642 |
| -1.990000000000064 | 2.227 | 2.441 | 2.638 |
| -1.985000000000064 | 2.223 | 2.437 | 2.634 |
| -1.980000000000064 | 2.218 | 2.433 | 2.631 |
| -1.975000000000064 | 2.214 | 2.429 | 2.627 |
| -1.970000000000065 | 2.209 | 2.425 | 2.623 |
| -1.965000000000065 | 2.205 | 2.421 | 2.619 |
| -1.960000000000065 | 2.2 | 2.417 | 2.616 |
| -1.955000000000065 | 2.196 | 2.413 | 2.612 |
| -1.950000000000065 | 2.191 | 2.409 | 2.608 |
| -1.945000000000065 | 2.187 | 2.405 | 2.604 |
| -1.940000000000065 | 2.183 | 2.401 | 2.601 |
| -1.935000000000065 | 2.178 | 2.397 | 2.597 |
| -1.930000000000065 | 2.174 | 2.393 | 2.593 |
| -1.925000000000066 | 2.169 | 2.389 | 2.59 |
| -1.920000000000066 | 2.165 | 2.385 | 2.586 |
| -1.915000000000066 | 2.16 | 2.381 | 2.582 |
| -1.910000000000066 | 2.156 | 2.377 | 2.578 |
| -1.905000000000066 | 2.152 | 2.373 | 2.575 |
| -1.900000000000066 | 2.147 | 2.369 | 2.571 |
| -1.895000000000066 | 2.143 | 2.365 | 2.567 |
| -1.890000000000066 | 2.138 | 2.361 | 2.564 |
| -1.885000000000066 | 2.134 | 2.357 | 2.56 |
| -1.880000000000066 | 2.129 | 2.353 | 2.556 |
| -1.875000000000067 | 2.125 | 2.349 | 2.553 |
| -1.870000000000067 | 2.121 | 2.345 | 2.549 |
| -1.865000000000067 | 2.116 | 2.341 | 2.545 |
| -1.860000000000067 | 2.112 | 2.337 | 2.542 |
| -1.855000000000067 | 2.107 | 2.333 | 2.538 |
| -1.850000000000067 | 2.103 | 2.329 | 2.534 |
| -1.845000000000067 | 2.099 | 2.325 | 2.531 |
| -1.840000000000067 | 2.094 | 2.321 | 2.527 |
| -1.835000000000067 | 2.09 | 2.317 | 2.523 |
| -1.830000000000068 | 2.085 | 2.313 | 2.52 |
| -1.825000000000068 | 2.081 | 2.309 | 2.516 |
| -1.820000000000068 | 2.077 | 2.305 | 2.512 |
| -1.815000000000068 | 2.072 | 2.301 | 2.509 |
| -1.810000000000068 | 2.068 | 2.297 | 2.505 |
| -1.805000000000068 | 2.063 | 2.293 | 2.502 |
| -1.800000000000068 | 2.059 | 2.289 | 2.498 |
| -1.795000000000068 | 2.055 | 2.285 | 2.494 |
| -1.790000000000068 | 2.05 | 2.281 | 2.491 |
| -1.785000000000068 | 2.046 | 2.277 | 2.487 |
| -1.780000000000069 | 2.042 | 2.273 | 2.484 |
| -1.775000000000069 | 2.037 | 2.269 | 2.48 |
| -1.770000000000069 | 2.033 | 2.266 | 2.476 |
| -1.765000000000069 | 2.029 | 2.262 | 2.473 |
| -1.760000000000069 | 2.024 | 2.258 | 2.469 |
| -1.75500000000007 | 2.02 | 2.254 | 2.466 |
| -1.75000000000007 | 2.016 | 2.25 | 2.462 |
| -1.745000000000069 | 2.011 | 2.246 | 2.459 |
| -1.740000000000069 | 2.007 | 2.242 | 2.455 |
| -1.73500000000007 | 2.003 | 2.238 | 2.452 |
| -1.73000000000007 | 1.998 | 2.234 | 2.448 |
| -1.72500000000007 | 1.994 | 2.231 | 2.445 |
| -1.72000000000007 | 1.99 | 2.227 | 2.441 |
| -1.71500000000007 | 1.985 | 2.223 | 2.437 |
| -1.71000000000007 | 1.981 | 2.219 | 2.434 |
| -1.70500000000007 | 1.977 | 2.215 | 2.43 |
| -1.70000000000007 | 1.972 | 2.211 | 2.427 |
| -1.69500000000007 | 1.968 | 2.207 | 2.423 |
| -1.69000000000007 | 1.964 | 2.204 | 2.42 |
| -1.685000000000071 | 1.959 | 2.2 | 2.416 |
| -1.680000000000071 | 1.955 | 2.196 | 2.413 |
| -1.675000000000071 | 1.951 | 2.192 | 2.409 |
| -1.670000000000071 | 1.947 | 2.188 | 2.406 |
| -1.665000000000071 | 1.942 | 2.185 | 2.403 |
| -1.660000000000071 | 1.938 | 2.181 | 2.399 |
| -1.655000000000071 | 1.934 | 2.177 | 2.396 |
| -1.650000000000071 | 1.929 | 2.173 | 2.392 |
| -1.645000000000071 | 1.925 | 2.169 | 2.389 |
| -1.640000000000072 | 1.921 | 2.166 | 2.385 |
| -1.635000000000072 | 1.917 | 2.162 | 2.382 |
| -1.630000000000072 | 1.912 | 2.158 | 2.378 |
| -1.625000000000072 | 1.908 | 2.154 | 2.375 |
| -1.620000000000072 | 1.904 | 2.15 | 2.372 |
| -1.615000000000072 | 1.9 | 2.147 | 2.368 |
| -1.610000000000072 | 1.895 | 2.143 | 2.365 |
| -1.605000000000072 | 1.891 | 2.139 | 2.361 |
| -1.600000000000072 | 1.887 | 2.135 | 2.358 |
| -1.595000000000073 | 1.883 | 2.132 | 2.355 |
| -1.590000000000073 | 1.878 | 2.128 | 2.351 |
| -1.585000000000073 | 1.874 | 2.124 | 2.348 |
| -1.580000000000073 | 1.87 | 2.12 | 2.344 |
| -1.575000000000073 | 1.866 | 2.117 | 2.341 |
| -1.570000000000073 | 1.861 | 2.113 | 2.338 |
| -1.565000000000073 | 1.857 | 2.109 | 2.334 |
| -1.560000000000073 | 1.853 | 2.106 | 2.331 |
| -1.555000000000073 | 1.849 | 2.102 | 2.328 |
| -1.550000000000074 | 1.845 | 2.098 | 2.324 |
| -1.545000000000074 | 1.84 | 2.095 | 2.321 |
| -1.540000000000074 | 1.836 | 2.091 | 2.318 |
| -1.535000000000074 | 1.832 | 2.087 | 2.314 |
| -1.530000000000074 | 1.828 | 2.083 | 2.311 |
| -1.525000000000074 | 1.824 | 2.08 | 2.308 |
| -1.520000000000074 | 1.819 | 2.076 | 2.304 |
| -1.515000000000074 | 1.815 | 2.072 | 2.301 |
| -1.510000000000074 | 1.811 | 2.069 | 2.298 |
| -1.505000000000074 | 1.807 | 2.065 | 2.295 |
| -1.500000000000075 | 1.803 | 2.062 | 2.291 |
| -1.495000000000075 | 1.799 | 2.058 | 2.288 |
| -1.490000000000075 | 1.794 | 2.054 | 2.285 |
| -1.485000000000075 | 1.79 | 2.051 | 2.281 |
| -1.480000000000075 | 1.786 | 2.047 | 2.278 |
| -1.475000000000075 | 1.782 | 2.043 | 2.275 |
| -1.470000000000075 | 1.778 | 2.04 | 2.272 |
| -1.465000000000075 | 1.774 | 2.036 | 2.269 |
| -1.460000000000075 | 1.77 | 2.033 | 2.265 |
| -1.455000000000076 | 1.766 | 2.029 | 2.262 |
| -1.450000000000076 | 1.761 | 2.025 | 2.259 |
| -1.445000000000076 | 1.757 | 2.022 | 2.256 |
| -1.440000000000076 | 1.753 | 2.018 | 2.252 |
| -1.435000000000076 | 1.749 | 2.015 | 2.249 |
| -1.430000000000076 | 1.745 | 2.011 | 2.246 |
| -1.425000000000076 | 1.741 | 2.008 | 2.243 |
| -1.420000000000076 | 1.737 | 2.004 | 2.24 |
| -1.415000000000076 | 1.733 | 2.001 | 2.237 |
| -1.410000000000077 | 1.729 | 1.997 | 2.233 |
| -1.405000000000077 | 1.725 | 1.993 | 2.23 |
| -1.400000000000077 | 1.72 | 1.99 | 2.227 |
| -1.395000000000077 | 1.716 | 1.986 | 2.224 |
| -1.390000000000077 | 1.712 | 1.983 | 2.221 |
| -1.385000000000077 | 1.708 | 1.979 | 2.218 |
| -1.380000000000077 | 1.704 | 1.976 | 2.215 |
| -1.375000000000077 | 1.7 | 1.972 | 2.211 |
| -1.370000000000077 | 1.696 | 1.969 | 2.208 |
| -1.365000000000077 | 1.692 | 1.966 | 2.205 |
| -1.360000000000078 | 1.688 | 1.962 | 2.202 |
| -1.355000000000078 | 1.684 | 1.959 | 2.199 |
| -1.350000000000078 | 1.68 | 1.955 | 2.196 |
| -1.345000000000078 | 1.676 | 1.952 | 2.193 |
| -1.340000000000078 | 1.672 | 1.948 | 2.19 |
| -1.335000000000078 | 1.668 | 1.945 | 2.187 |
| -1.330000000000078 | 1.664 | 1.941 | 2.184 |
| -1.325000000000078 | 1.66 | 1.938 | 2.181 |
| -1.320000000000078 | 1.656 | 1.935 | 2.178 |
| -1.315000000000079 | 1.652 | 1.931 | 2.175 |
| -1.310000000000079 | 1.648 | 1.928 | 2.172 |
| -1.305000000000079 | 1.644 | 1.924 | 2.169 |
| -1.300000000000079 | 1.64 | 1.921 | 2.166 |
| -1.295000000000079 | 1.636 | 1.918 | 2.163 |
| -1.29000000000008 | 1.632 | 1.914 | 2.16 |
| -1.285000000000079 | 1.628 | 1.911 | 2.157 |
| -1.280000000000079 | 1.624 | 1.907 | 2.154 |
| -1.275000000000079 | 1.62 | 1.904 | 2.151 |
| -1.270000000000079 | 1.616 | 1.901 | 2.148 |
| -1.26500000000008 | 1.613 | 1.897 | 2.145 |
| -1.26000000000008 | 1.609 | 1.894 | 2.142 |
| -1.25500000000008 | 1.605 | 1.891 | 2.139 |
| -1.25000000000008 | 1.601 | 1.887 | 2.136 |
| -1.24500000000008 | 1.597 | 1.884 | 2.133 |
| -1.24000000000008 | 1.593 | 1.881 | 2.13 |
| -1.23500000000008 | 1.589 | 1.878 | 2.127 |
| -1.23000000000008 | 1.585 | 1.874 | 2.124 |
| -1.22500000000008 | 1.581 | 1.871 | 2.121 |
| -1.220000000000081 | 1.577 | 1.868 | 2.119 |
| -1.215000000000081 | 1.574 | 1.864 | 2.116 |
| -1.210000000000081 | 1.57 | 1.861 | 2.113 |
| -1.205000000000081 | 1.566 | 1.858 | 2.11 |
| -1.200000000000081 | 1.562 | 1.855 | 2.107 |
| -1.195000000000081 | 1.558 | 1.851 | 2.104 |
| -1.190000000000081 | 1.554 | 1.848 | 2.101 |
| -1.185000000000081 | 1.551 | 1.845 | 2.099 |
| -1.180000000000081 | 1.547 | 1.842 | 2.096 |
| -1.175000000000082 | 1.543 | 1.839 | 2.093 |
| -1.170000000000082 | 1.539 | 1.835 | 2.09 |
| -1.165000000000082 | 1.535 | 1.832 | 2.087 |
| -1.160000000000082 | 1.532 | 1.829 | 2.085 |
| -1.155000000000082 | 1.528 | 1.826 | 2.082 |
| -1.150000000000082 | 1.524 | 1.823 | 2.079 |
| -1.145000000000082 | 1.52 | 1.82 | 2.076 |
| -1.140000000000082 | 1.516 | 1.816 | 2.074 |
| -1.135000000000082 | 1.513 | 1.813 | 2.071 |
| -1.130000000000082 | 1.509 | 1.81 | 2.068 |
| -1.125000000000083 | 1.505 | 1.807 | 2.065 |
| -1.120000000000083 | 1.501 | 1.804 | 2.063 |
| -1.115000000000083 | 1.498 | 1.801 | 2.06 |
| -1.110000000000083 | 1.494 | 1.798 | 2.057 |
| -1.105000000000083 | 1.49 | 1.795 | 2.055 |
| -1.100000000000083 | 1.487 | 1.792 | 2.052 |
| -1.095000000000083 | 1.483 | 1.789 | 2.049 |
| -1.090000000000083 | 1.479 | 1.786 | 2.046 |
| -1.085000000000083 | 1.476 | 1.782 | 2.044 |
| -1.080000000000084 | 1.472 | 1.779 | 2.041 |
| -1.075000000000084 | 1.468 | 1.776 | 2.039 |
| -1.070000000000084 | 1.465 | 1.773 | 2.036 |
| -1.065000000000084 | 1.461 | 1.77 | 2.033 |
| -1.060000000000084 | 1.457 | 1.767 | 2.031 |
| -1.055000000000084 | 1.454 | 1.764 | 2.028 |
| -1.050000000000084 | 1.45 | 1.761 | 2.025 |
| -1.045000000000084 | 1.446 | 1.758 | 2.023 |
| -1.040000000000084 | 1.443 | 1.755 | 2.02 |
| -1.035000000000085 | 1.439 | 1.752 | 2.018 |
| -1.030000000000085 | 1.436 | 1.75 | 2.015 |
| -1.025000000000085 | 1.432 | 1.747 | 2.013 |
| -1.020000000000085 | 1.428 | 1.744 | 2.01 |
| -1.015000000000085 | 1.425 | 1.741 | 2.008 |
| -1.010000000000085 | 1.421 | 1.738 | 2.005 |
| -1.005000000000085 | 1.418 | 1.735 | 2.003 |
| -1.000000000000085 | 1.414 | 1.732 | 2 |
| -0.995000000000085 | 1.411 | 1.729 | 1.998 |
| -0.990000000000085 | 1.407 | 1.726 | 1.995 |
| -0.985000000000085 | 1.404 | 1.723 | 1.993 |
| -0.980000000000085 | 1.4 | 1.721 | 1.99 |
| -0.975000000000085 | 1.397 | 1.718 | 1.988 |
| -0.970000000000085 | 1.393 | 1.715 | 1.985 |
| -0.965000000000085 | 1.39 | 1.712 | 1.983 |
| -0.960000000000085 | 1.386 | 1.709 | 1.98 |
| -0.955000000000085 | 1.383 | 1.706 | 1.978 |
| -0.950000000000085 | 1.379 | 1.704 | 1.975 |
| -0.945000000000085 | 1.376 | 1.701 | 1.973 |
| -0.940000000000085 | 1.372 | 1.698 | 1.971 |
| -0.935000000000085 | 1.369 | 1.695 | 1.968 |
| -0.930000000000085 | 1.366 | 1.693 | 1.966 |
| -0.925000000000085 | 1.362 | 1.69 | 1.964 |
| -0.920000000000085 | 1.359 | 1.687 | 1.961 |
| -0.915000000000085 | 1.355 | 1.684 | 1.959 |
| -0.910000000000085 | 1.352 | 1.682 | 1.957 |
| -0.905000000000085 | 1.349 | 1.679 | 1.954 |
| -0.900000000000085 | 1.345 | 1.676 | 1.952 |
| -0.895000000000085 | 1.342 | 1.674 | 1.95 |
| -0.890000000000085 | 1.339 | 1.671 | 1.947 |
| -0.885000000000085 | 1.335 | 1.668 | 1.945 |
| -0.880000000000085 | 1.332 | 1.666 | 1.943 |
| -0.875000000000085 | 1.329 | 1.663 | 1.941 |
| -0.870000000000085 | 1.325 | 1.66 | 1.938 |
| -0.865000000000085 | 1.322 | 1.658 | 1.936 |
| -0.860000000000085 | 1.319 | 1.655 | 1.934 |
| -0.855000000000085 | 1.316 | 1.653 | 1.932 |
| -0.850000000000085 | 1.312 | 1.65 | 1.929 |
| -0.845000000000085 | 1.309 | 1.647 | 1.927 |
| -0.840000000000085 | 1.306 | 1.645 | 1.925 |
| -0.835000000000085 | 1.303 | 1.642 | 1.923 |
| -0.830000000000085 | 1.3 | 1.64 | 1.921 |
| -0.825000000000085 | 1.296 | 1.637 | 1.918 |
| -0.820000000000085 | 1.293 | 1.635 | 1.916 |
| -0.815000000000085 | 1.29 | 1.632 | 1.914 |
| -0.810000000000085 | 1.287 | 1.63 | 1.912 |
| -0.805000000000085 | 1.284 | 1.627 | 1.91 |
| -0.800000000000085 | 1.281 | 1.625 | 1.908 |
| -0.795000000000085 | 1.278 | 1.622 | 1.906 |
| -0.790000000000085 | 1.274 | 1.62 | 1.904 |
| -0.785000000000085 | 1.271 | 1.617 | 1.902 |
| -0.780000000000085 | 1.268 | 1.615 | 1.9 |
| -0.775000000000085 | 1.265 | 1.613 | 1.898 |
| -0.770000000000085 | 1.262 | 1.61 | 1.895 |
| -0.765000000000085 | 1.259 | 1.608 | 1.893 |
| -0.760000000000085 | 1.256 | 1.605 | 1.891 |
| -0.755000000000085 | 1.253 | 1.603 | 1.889 |
| -0.750000000000085 | 1.25 | 1.601 | 1.887 |
| -0.745000000000085 | 1.247 | 1.598 | 1.885 |
| -0.740000000000085 | 1.244 | 1.596 | 1.884 |
| -0.735000000000085 | 1.241 | 1.594 | 1.882 |
| -0.730000000000085 | 1.238 | 1.592 | 1.88 |
| -0.725000000000085 | 1.235 | 1.589 | 1.878 |
| -0.720000000000085 | 1.232 | 1.587 | 1.876 |
| -0.715000000000085 | 1.229 | 1.585 | 1.874 |
| -0.710000000000085 | 1.226 | 1.582 | 1.872 |
| -0.705000000000085 | 1.224 | 1.58 | 1.87 |
| -0.700000000000085 | 1.221 | 1.578 | 1.868 |
| -0.695000000000085 | 1.218 | 1.576 | 1.866 |
| -0.690000000000085 | 1.215 | 1.574 | 1.864 |
| -0.685000000000085 | 1.212 | 1.571 | 1.863 |
| -0.680000000000085 | 1.209 | 1.569 | 1.861 |
| -0.675000000000085 | 1.206 | 1.567 | 1.859 |
| -0.670000000000085 | 1.204 | 1.565 | 1.857 |
| -0.665000000000085 | 1.201 | 1.563 | 1.855 |
| -0.660000000000085 | 1.198 | 1.561 | 1.854 |
| -0.655000000000085 | 1.195 | 1.559 | 1.852 |
| -0.650000000000085 | 1.193 | 1.556 | 1.85 |
| -0.645000000000085 | 1.19 | 1.554 | 1.848 |
| -0.640000000000085 | 1.187 | 1.552 | 1.847 |
| -0.635000000000085 | 1.185 | 1.55 | 1.845 |
| -0.630000000000085 | 1.182 | 1.548 | 1.843 |
| -0.625000000000085 | 1.179 | 1.546 | 1.841 |
| -0.620000000000085 | 1.177 | 1.544 | 1.84 |
| -0.615000000000085 | 1.174 | 1.542 | 1.838 |
| -0.610000000000085 | 1.171 | 1.54 | 1.836 |
| -0.605000000000085 | 1.169 | 1.538 | 1.835 |
| -0.600000000000085 | 1.166 | 1.536 | 1.833 |
| -0.595000000000085 | 1.164 | 1.534 | 1.831 |
| -0.590000000000085 | 1.161 | 1.532 | 1.83 |
| -0.585000000000085 | 1.159 | 1.53 | 1.828 |
| -0.580000000000085 | 1.156 | 1.529 | 1.827 |
| -0.575000000000085 | 1.154 | 1.527 | 1.825 |
| -0.570000000000085 | 1.151 | 1.525 | 1.823 |
| -0.565000000000085 | 1.149 | 1.523 | 1.822 |
| -0.560000000000085 | 1.146 | 1.521 | 1.82 |
| -0.555000000000085 | 1.144 | 1.519 | 1.819 |
| -0.550000000000085 | 1.141 | 1.517 | 1.817 |
| -0.545000000000085 | 1.139 | 1.516 | 1.816 |
| -0.540000000000085 | 1.136 | 1.514 | 1.814 |
| -0.535000000000085 | 1.134 | 1.512 | 1.813 |
| -0.530000000000085 | 1.132 | 1.51 | 1.811 |
| -0.525000000000085 | 1.129 | 1.509 | 1.81 |
| -0.520000000000085 | 1.127 | 1.507 | 1.808 |
| -0.515000000000085 | 1.125 | 1.505 | 1.807 |
| -0.510000000000085 | 1.123 | 1.503 | 1.806 |
| -0.505000000000085 | 1.12 | 1.502 | 1.804 |
| -0.500000000000085 | 1.118 | 1.5 | 1.803 |
| -0.495000000000085 | 1.116 | 1.498 | 1.801 |
| -0.490000000000085 | 1.114 | 1.497 | 1.8 |
| -0.485000000000085 | 1.111 | 1.495 | 1.799 |
| -0.480000000000085 | 1.109 | 1.493 | 1.797 |
| -0.475000000000085 | 1.107 | 1.492 | 1.796 |
| -0.470000000000085 | 1.105 | 1.49 | 1.795 |
| -0.465000000000085 | 1.103 | 1.489 | 1.793 |
| -0.460000000000085 | 1.101 | 1.487 | 1.792 |
| -0.455000000000085 | 1.099 | 1.486 | 1.791 |
| -0.450000000000085 | 1.097 | 1.484 | 1.79 |
| -0.445000000000085 | 1.095 | 1.483 | 1.788 |
| -0.440000000000085 | 1.093 | 1.481 | 1.787 |
| -0.435000000000085 | 1.091 | 1.48 | 1.786 |
| -0.430000000000085 | 1.089 | 1.478 | 1.785 |
| -0.425000000000085 | 1.087 | 1.477 | 1.783 |
| -0.420000000000085 | 1.085 | 1.475 | 1.782 |
| -0.415000000000085 | 1.083 | 1.474 | 1.781 |
| -0.410000000000085 | 1.081 | 1.472 | 1.78 |
| -0.405000000000085 | 1.079 | 1.471 | 1.779 |
| -0.400000000000085 | 1.077 | 1.47 | 1.778 |
| -0.395000000000085 | 1.075 | 1.468 | 1.777 |
| -0.390000000000085 | 1.073 | 1.467 | 1.775 |
| -0.385000000000085 | 1.072 | 1.466 | 1.774 |
| -0.380000000000085 | 1.07 | 1.464 | 1.773 |
| -0.375000000000085 | 1.068 | 1.463 | 1.772 |
| -0.370000000000085 | 1.066 | 1.462 | 1.771 |
| -0.365000000000085 | 1.065 | 1.461 | 1.77 |
| -0.360000000000085 | 1.063 | 1.459 | 1.769 |
| -0.355000000000085 | 1.061 | 1.458 | 1.768 |
| -0.350000000000085 | 1.059 | 1.457 | 1.767 |
| -0.345000000000085 | 1.058 | 1.456 | 1.766 |
| -0.340000000000085 | 1.056 | 1.455 | 1.765 |
| -0.335000000000085 | 1.055 | 1.453 | 1.764 |
| -0.330000000000085 | 1.053 | 1.452 | 1.763 |
| -0.325000000000085 | 1.051 | 1.451 | 1.762 |
| -0.320000000000085 | 1.05 | 1.45 | 1.761 |
| -0.315000000000085 | 1.048 | 1.449 | 1.76 |
| -0.310000000000085 | 1.047 | 1.448 | 1.76 |
| -0.305000000000085 | 1.045 | 1.447 | 1.759 |
| -0.300000000000085 | 1.044 | 1.446 | 1.758 |
| -0.295000000000085 | 1.043 | 1.445 | 1.757 |
| -0.290000000000085 | 1.041 | 1.444 | 1.756 |
| -0.285000000000085 | 1.04 | 1.443 | 1.755 |
| -0.280000000000085 | 1.038 | 1.442 | 1.755 |
| -0.275000000000085 | 1.037 | 1.441 | 1.754 |
| -0.270000000000085 | 1.036 | 1.44 | 1.753 |
| -0.265000000000085 | 1.035 | 1.439 | 1.752 |
| -0.260000000000085 | 1.033 | 1.438 | 1.751 |
| -0.255000000000085 | 1.032 | 1.437 | 1.751 |
| -0.250000000000085 | 1.031 | 1.436 | 1.75 |
| -0.245000000000085 | 1.03 | 1.435 | 1.749 |
| -0.240000000000085 | 1.028 | 1.434 | 1.749 |
| -0.235000000000085 | 1.027 | 1.434 | 1.748 |
| -0.230000000000085 | 1.026 | 1.433 | 1.747 |
| -0.225000000000085 | 1.025 | 1.432 | 1.747 |
| -0.220000000000085 | 1.024 | 1.431 | 1.746 |
| -0.215000000000085 | 1.023 | 1.43 | 1.745 |
| -0.210000000000085 | 1.022 | 1.43 | 1.745 |
| -0.205000000000085 | 1.021 | 1.429 | 1.744 |
| -0.200000000000085 | 1.02 | 1.428 | 1.744 |
| -0.195000000000085 | 1.019 | 1.428 | 1.743 |
| -0.190000000000085 | 1.018 | 1.427 | 1.742 |
| -0.185000000000085 | 1.017 | 1.426 | 1.742 |
| -0.180000000000085 | 1.016 | 1.426 | 1.741 |
| -0.175000000000085 | 1.015 | 1.425 | 1.741 |
| -0.170000000000085 | 1.014 | 1.424 | 1.74 |
| -0.165000000000085 | 1.014 | 1.424 | 1.74 |
| -0.160000000000085 | 1.013 | 1.423 | 1.739 |
| -0.155000000000084 | 1.012 | 1.423 | 1.739 |
| -0.150000000000084 | 1.011 | 1.422 | 1.739 |
| -0.145000000000084 | 1.01 | 1.422 | 1.738 |
| -0.140000000000084 | 1.01 | 1.421 | 1.738 |
| -0.135000000000084 | 1.009 | 1.421 | 1.737 |
| -0.130000000000084 | 1.008 | 1.42 | 1.737 |
| -0.125000000000084 | 1.008 | 1.42 | 1.737 |
| -0.120000000000084 | 1.007 | 1.419 | 1.736 |
| -0.115000000000084 | 1.007 | 1.419 | 1.736 |
| -0.110000000000084 | 1.006 | 1.418 | 1.736 |
| -0.105000000000084 | 1.005 | 1.418 | 1.735 |
| -0.100000000000084 | 1.005 | 1.418 | 1.735 |
| -0.0950000000000844 | 1.005 | 1.417 | 1.735 |
| -0.0900000000000844 | 1.004 | 1.417 | 1.734 |
| -0.0850000000000844 | 1.004 | 1.417 | 1.734 |
| -0.0800000000000844 | 1.003 | 1.416 | 1.734 |
| -0.0750000000000844 | 1.003 | 1.416 | 1.734 |
| -0.0700000000000844 | 1.002 | 1.416 | 1.733 |
| -0.0650000000000844 | 1.002 | 1.416 | 1.733 |
| -0.0600000000000844 | 1.002 | 1.415 | 1.733 |
| -0.0550000000000844 | 1.002 | 1.415 | 1.733 |
| -0.0500000000000844 | 1.001 | 1.415 | 1.733 |
| -0.0450000000000844 | 1.001 | 1.415 | 1.733 |
| -0.0400000000000844 | 1.001 | 1.415 | 1.733 |
| -0.0350000000000844 | 1.001 | 1.415 | 1.732 |
| -0.0300000000000844 | 1 | 1.415 | 1.732 |
| -0.0250000000000844 | 1 | 1.414 | 1.732 |
| -0.0200000000000844 | 1 | 1.414 | 1.732 |
| -0.0150000000000844 | 1 | 1.414 | 1.732 |
| -0.0100000000000844 | 1 | 1.414 | 1.732 |
| -0.00500000000008444 | 1 | 1.414 | 1.732 |
| -8.4444604087075e-14 | 1 | 1.414 | 1.732 |
| 0.00499999999991555 | 1 | 1.414 | 1.732 |
| 0.00999999999991555 | 1 | 1.414 | 1.732 |
| 0.0149999999999156 | 1 | 1.414 | 1.732 |
| 0.0199999999999156 | 1 | 1.414 | 1.732 |
| 0.0249999999999156 | 1 | 1.414 | 1.732 |
| 0.0299999999999156 | 1 | 1.415 | 1.732 |
| 0.0349999999999155 | 1.001 | 1.415 | 1.732 |
| 0.0399999999999155 | 1.001 | 1.415 | 1.733 |
| 0.0449999999999155 | 1.001 | 1.415 | 1.733 |
| 0.0499999999999155 | 1.001 | 1.415 | 1.733 |
| 0.0549999999999155 | 1.002 | 1.415 | 1.733 |
| 0.0599999999999155 | 1.002 | 1.415 | 1.733 |
| 0.0649999999999155 | 1.002 | 1.416 | 1.733 |
| 0.0699999999999155 | 1.002 | 1.416 | 1.733 |
| 0.0749999999999155 | 1.003 | 1.416 | 1.734 |
| 0.0799999999999155 | 1.003 | 1.416 | 1.734 |
| 0.0849999999999155 | 1.004 | 1.417 | 1.734 |
| 0.0899999999999155 | 1.004 | 1.417 | 1.734 |
| 0.0949999999999155 | 1.005 | 1.417 | 1.735 |
| 0.0999999999999155 | 1.005 | 1.418 | 1.735 |
| 0.104999999999916 | 1.005 | 1.418 | 1.735 |
| 0.109999999999916 | 1.006 | 1.418 | 1.736 |
| 0.114999999999916 | 1.007 | 1.419 | 1.736 |
| 0.119999999999916 | 1.007 | 1.419 | 1.736 |
| 0.124999999999916 | 1.008 | 1.42 | 1.737 |
| 0.129999999999916 | 1.008 | 1.42 | 1.737 |
| 0.134999999999916 | 1.009 | 1.421 | 1.737 |
| 0.139999999999916 | 1.01 | 1.421 | 1.738 |
| 0.144999999999916 | 1.01 | 1.422 | 1.738 |
| 0.149999999999916 | 1.011 | 1.422 | 1.739 |
| 0.154999999999916 | 1.012 | 1.423 | 1.739 |
| 0.159999999999916 | 1.013 | 1.423 | 1.739 |
| 0.164999999999916 | 1.014 | 1.424 | 1.74 |
| 0.169999999999916 | 1.014 | 1.424 | 1.74 |
| 0.174999999999916 | 1.015 | 1.425 | 1.741 |
| 0.179999999999916 | 1.016 | 1.426 | 1.741 |
| 0.184999999999916 | 1.017 | 1.426 | 1.742 |
| 0.189999999999916 | 1.018 | 1.427 | 1.742 |
| 0.194999999999916 | 1.019 | 1.428 | 1.743 |
| 0.199999999999916 | 1.02 | 1.428 | 1.744 |
| 0.204999999999916 | 1.021 | 1.429 | 1.744 |
| 0.209999999999916 | 1.022 | 1.43 | 1.745 |
| 0.214999999999916 | 1.023 | 1.43 | 1.745 |
| 0.219999999999916 | 1.024 | 1.431 | 1.746 |
| 0.224999999999916 | 1.025 | 1.432 | 1.747 |
| 0.229999999999916 | 1.026 | 1.433 | 1.747 |
| 0.234999999999916 | 1.027 | 1.434 | 1.748 |
| 0.239999999999916 | 1.028 | 1.434 | 1.749 |
| 0.244999999999916 | 1.03 | 1.435 | 1.749 |
| 0.249999999999916 | 1.031 | 1.436 | 1.75 |
| 0.254999999999916 | 1.032 | 1.437 | 1.751 |
| 0.259999999999916 | 1.033 | 1.438 | 1.751 |
| 0.264999999999916 | 1.035 | 1.439 | 1.752 |
| 0.269999999999916 | 1.036 | 1.44 | 1.753 |
| 0.274999999999916 | 1.037 | 1.441 | 1.754 |
| 0.279999999999916 | 1.038 | 1.442 | 1.755 |
| 0.284999999999916 | 1.04 | 1.443 | 1.755 |
| 0.289999999999916 | 1.041 | 1.444 | 1.756 |
| 0.294999999999916 | 1.043 | 1.445 | 1.757 |
| 0.299999999999916 | 1.044 | 1.446 | 1.758 |
| 0.304999999999916 | 1.045 | 1.447 | 1.759 |
| 0.309999999999916 | 1.047 | 1.448 | 1.76 |
| 0.314999999999916 | 1.048 | 1.449 | 1.76 |
| 0.319999999999916 | 1.05 | 1.45 | 1.761 |
| 0.324999999999916 | 1.051 | 1.451 | 1.762 |
| 0.329999999999916 | 1.053 | 1.452 | 1.763 |
| 0.334999999999916 | 1.055 | 1.453 | 1.764 |
| 0.339999999999916 | 1.056 | 1.455 | 1.765 |
| 0.344999999999916 | 1.058 | 1.456 | 1.766 |
| 0.349999999999916 | 1.059 | 1.457 | 1.767 |
| 0.354999999999916 | 1.061 | 1.458 | 1.768 |
| 0.359999999999916 | 1.063 | 1.459 | 1.769 |
| 0.364999999999916 | 1.065 | 1.461 | 1.77 |
| 0.369999999999916 | 1.066 | 1.462 | 1.771 |
| 0.374999999999916 | 1.068 | 1.463 | 1.772 |
| 0.379999999999916 | 1.07 | 1.464 | 1.773 |
| 0.384999999999916 | 1.072 | 1.466 | 1.774 |
| 0.389999999999916 | 1.073 | 1.467 | 1.775 |
| 0.394999999999916 | 1.075 | 1.468 | 1.777 |
| 0.399999999999916 | 1.077 | 1.47 | 1.778 |
| 0.404999999999916 | 1.079 | 1.471 | 1.779 |
| 0.409999999999916 | 1.081 | 1.472 | 1.78 |
| 0.414999999999916 | 1.083 | 1.474 | 1.781 |
| 0.419999999999916 | 1.085 | 1.475 | 1.782 |
| 0.424999999999916 | 1.087 | 1.477 | 1.783 |
| 0.429999999999916 | 1.089 | 1.478 | 1.785 |
| 0.434999999999916 | 1.091 | 1.48 | 1.786 |
| 0.439999999999916 | 1.093 | 1.481 | 1.787 |
| 0.444999999999916 | 1.095 | 1.483 | 1.788 |
| 0.449999999999916 | 1.097 | 1.484 | 1.79 |
| 0.454999999999916 | 1.099 | 1.486 | 1.791 |
| 0.459999999999916 | 1.101 | 1.487 | 1.792 |
| 0.464999999999916 | 1.103 | 1.489 | 1.793 |
| 0.469999999999916 | 1.105 | 1.49 | 1.795 |
| 0.474999999999916 | 1.107 | 1.492 | 1.796 |
| 0.479999999999916 | 1.109 | 1.493 | 1.797 |
| 0.484999999999916 | 1.111 | 1.495 | 1.799 |
| 0.489999999999916 | 1.114 | 1.497 | 1.8 |
| 0.494999999999916 | 1.116 | 1.498 | 1.801 |
| 0.499999999999916 | 1.118 | 1.5 | 1.803 |
| 0.504999999999916 | 1.12 | 1.502 | 1.804 |
| 0.509999999999916 | 1.123 | 1.503 | 1.806 |
| 0.514999999999916 | 1.125 | 1.505 | 1.807 |
| 0.519999999999916 | 1.127 | 1.507 | 1.808 |
| 0.524999999999916 | 1.129 | 1.509 | 1.81 |
| 0.529999999999916 | 1.132 | 1.51 | 1.811 |
| 0.534999999999916 | 1.134 | 1.512 | 1.813 |
| 0.539999999999916 | 1.136 | 1.514 | 1.814 |
| 0.544999999999916 | 1.139 | 1.516 | 1.816 |
| 0.549999999999916 | 1.141 | 1.517 | 1.817 |
| 0.554999999999916 | 1.144 | 1.519 | 1.819 |
| 0.559999999999916 | 1.146 | 1.521 | 1.82 |
| 0.564999999999916 | 1.149 | 1.523 | 1.822 |
| 0.569999999999916 | 1.151 | 1.525 | 1.823 |
| 0.574999999999916 | 1.154 | 1.527 | 1.825 |
| 0.579999999999916 | 1.156 | 1.529 | 1.827 |
| 0.584999999999916 | 1.159 | 1.53 | 1.828 |
| 0.589999999999916 | 1.161 | 1.532 | 1.83 |
| 0.594999999999916 | 1.164 | 1.534 | 1.831 |
| 0.599999999999916 | 1.166 | 1.536 | 1.833 |
| 0.604999999999916 | 1.169 | 1.538 | 1.835 |
| 0.609999999999916 | 1.171 | 1.54 | 1.836 |
| 0.614999999999916 | 1.174 | 1.542 | 1.838 |
| 0.619999999999916 | 1.177 | 1.544 | 1.84 |
| 0.624999999999916 | 1.179 | 1.546 | 1.841 |
| 0.629999999999916 | 1.182 | 1.548 | 1.843 |
| 0.634999999999916 | 1.185 | 1.55 | 1.845 |
| 0.639999999999916 | 1.187 | 1.552 | 1.847 |
| 0.644999999999916 | 1.19 | 1.554 | 1.848 |
| 0.649999999999916 | 1.193 | 1.556 | 1.85 |
| 0.654999999999916 | 1.195 | 1.559 | 1.852 |
| 0.659999999999916 | 1.198 | 1.561 | 1.854 |
| 0.664999999999916 | 1.201 | 1.563 | 1.855 |
| 0.669999999999916 | 1.204 | 1.565 | 1.857 |
| 0.674999999999916 | 1.206 | 1.567 | 1.859 |
| 0.679999999999916 | 1.209 | 1.569 | 1.861 |
| 0.684999999999916 | 1.212 | 1.571 | 1.863 |
| 0.689999999999916 | 1.215 | 1.574 | 1.864 |
| 0.694999999999916 | 1.218 | 1.576 | 1.866 |
| 0.699999999999916 | 1.221 | 1.578 | 1.868 |
| 0.704999999999916 | 1.224 | 1.58 | 1.87 |
| 0.709999999999916 | 1.226 | 1.582 | 1.872 |
| 0.714999999999916 | 1.229 | 1.585 | 1.874 |
| 0.719999999999916 | 1.232 | 1.587 | 1.876 |
| 0.724999999999916 | 1.235 | 1.589 | 1.878 |
| 0.729999999999916 | 1.238 | 1.592 | 1.88 |
| 0.734999999999916 | 1.241 | 1.594 | 1.882 |
| 0.739999999999916 | 1.244 | 1.596 | 1.884 |
| 0.744999999999916 | 1.247 | 1.598 | 1.885 |
| 0.749999999999916 | 1.25 | 1.601 | 1.887 |
| 0.754999999999916 | 1.253 | 1.603 | 1.889 |
| 0.759999999999916 | 1.256 | 1.605 | 1.891 |
| 0.764999999999916 | 1.259 | 1.608 | 1.893 |
| 0.769999999999916 | 1.262 | 1.61 | 1.895 |
| 0.774999999999916 | 1.265 | 1.613 | 1.898 |
| 0.779999999999916 | 1.268 | 1.615 | 1.9 |
| 0.784999999999916 | 1.271 | 1.617 | 1.902 |
| 0.789999999999916 | 1.274 | 1.62 | 1.904 |
| 0.794999999999916 | 1.278 | 1.622 | 1.906 |
| 0.799999999999916 | 1.281 | 1.625 | 1.908 |
| 0.804999999999916 | 1.284 | 1.627 | 1.91 |
| 0.809999999999916 | 1.287 | 1.63 | 1.912 |
| 0.814999999999916 | 1.29 | 1.632 | 1.914 |
| 0.819999999999916 | 1.293 | 1.635 | 1.916 |
| 0.824999999999916 | 1.296 | 1.637 | 1.918 |
| 0.829999999999916 | 1.3 | 1.64 | 1.921 |
| 0.834999999999916 | 1.303 | 1.642 | 1.923 |
| 0.839999999999916 | 1.306 | 1.645 | 1.925 |
| 0.844999999999916 | 1.309 | 1.647 | 1.927 |
| 0.849999999999916 | 1.312 | 1.65 | 1.929 |
| 0.854999999999916 | 1.316 | 1.653 | 1.932 |
| 0.859999999999916 | 1.319 | 1.655 | 1.934 |
| 0.864999999999916 | 1.322 | 1.658 | 1.936 |
| 0.869999999999916 | 1.325 | 1.66 | 1.938 |
| 0.874999999999916 | 1.329 | 1.663 | 1.941 |
| 0.879999999999916 | 1.332 | 1.666 | 1.943 |
| 0.884999999999916 | 1.335 | 1.668 | 1.945 |
| 0.889999999999916 | 1.339 | 1.671 | 1.947 |
| 0.894999999999916 | 1.342 | 1.674 | 1.95 |
| 0.899999999999916 | 1.345 | 1.676 | 1.952 |
| 0.904999999999916 | 1.349 | 1.679 | 1.954 |
| 0.909999999999916 | 1.352 | 1.682 | 1.957 |
| 0.914999999999916 | 1.355 | 1.684 | 1.959 |
| 0.919999999999916 | 1.359 | 1.687 | 1.961 |
| 0.924999999999916 | 1.362 | 1.69 | 1.964 |
| 0.929999999999916 | 1.366 | 1.693 | 1.966 |
| 0.934999999999916 | 1.369 | 1.695 | 1.968 |
| 0.939999999999916 | 1.372 | 1.698 | 1.971 |
| 0.944999999999916 | 1.376 | 1.701 | 1.973 |
| 0.949999999999916 | 1.379 | 1.704 | 1.975 |
| 0.954999999999916 | 1.383 | 1.706 | 1.978 |
| 0.959999999999916 | 1.386 | 1.709 | 1.98 |
| 0.964999999999916 | 1.39 | 1.712 | 1.983 |
| 0.969999999999916 | 1.393 | 1.715 | 1.985 |
| 0.974999999999916 | 1.397 | 1.718 | 1.988 |
| 0.979999999999916 | 1.4 | 1.721 | 1.99 |
| 0.984999999999916 | 1.404 | 1.723 | 1.993 |
| 0.989999999999916 | 1.407 | 1.726 | 1.995 |
| 0.994999999999916 | 1.411 | 1.729 | 1.998 |
| 0.999999999999916 | 1.414 | 1.732 | 2 |
| 1.004999999999916 | 1.418 | 1.735 | 2.003 |
| 1.009999999999916 | 1.421 | 1.738 | 2.005 |
| 1.014999999999916 | 1.425 | 1.741 | 2.008 |
| 1.019999999999916 | 1.428 | 1.744 | 2.01 |
| 1.024999999999916 | 1.432 | 1.747 | 2.013 |
| 1.029999999999916 | 1.436 | 1.75 | 2.015 |
| 1.034999999999916 | 1.439 | 1.752 | 2.018 |
| 1.039999999999915 | 1.443 | 1.755 | 2.02 |
| 1.044999999999915 | 1.446 | 1.758 | 2.023 |
| 1.049999999999915 | 1.45 | 1.761 | 2.025 |
| 1.054999999999915 | 1.454 | 1.764 | 2.028 |
| 1.059999999999915 | 1.457 | 1.767 | 2.031 |
| 1.064999999999915 | 1.461 | 1.77 | 2.033 |
| 1.069999999999915 | 1.465 | 1.773 | 2.036 |
| 1.074999999999915 | 1.468 | 1.776 | 2.039 |
| 1.079999999999915 | 1.472 | 1.779 | 2.041 |
| 1.084999999999914 | 1.476 | 1.782 | 2.044 |
| 1.089999999999914 | 1.479 | 1.786 | 2.046 |
| 1.094999999999914 | 1.483 | 1.789 | 2.049 |
| 1.099999999999914 | 1.487 | 1.792 | 2.052 |
| 1.104999999999914 | 1.49 | 1.795 | 2.055 |
| 1.109999999999914 | 1.494 | 1.798 | 2.057 |
| 1.114999999999914 | 1.498 | 1.801 | 2.06 |
| 1.119999999999914 | 1.501 | 1.804 | 2.063 |
| 1.124999999999914 | 1.505 | 1.807 | 2.065 |
| 1.129999999999914 | 1.509 | 1.81 | 2.068 |
| 1.134999999999913 | 1.513 | 1.813 | 2.071 |
| 1.139999999999913 | 1.516 | 1.816 | 2.074 |
| 1.144999999999913 | 1.52 | 1.82 | 2.076 |
| 1.149999999999913 | 1.524 | 1.823 | 2.079 |
| 1.154999999999913 | 1.528 | 1.826 | 2.082 |
| 1.159999999999913 | 1.532 | 1.829 | 2.085 |
| 1.164999999999913 | 1.535 | 1.832 | 2.087 |
| 1.169999999999913 | 1.539 | 1.835 | 2.09 |
| 1.174999999999913 | 1.543 | 1.839 | 2.093 |
| 1.179999999999912 | 1.547 | 1.842 | 2.096 |
| 1.184999999999912 | 1.551 | 1.845 | 2.099 |
| 1.189999999999912 | 1.554 | 1.848 | 2.101 |
| 1.194999999999912 | 1.558 | 1.851 | 2.104 |
| 1.199999999999912 | 1.562 | 1.855 | 2.107 |
| 1.204999999999912 | 1.566 | 1.858 | 2.11 |
| 1.209999999999912 | 1.57 | 1.861 | 2.113 |
| 1.214999999999912 | 1.574 | 1.864 | 2.116 |
| 1.219999999999912 | 1.577 | 1.868 | 2.119 |
| 1.224999999999911 | 1.581 | 1.871 | 2.121 |
| 1.229999999999911 | 1.585 | 1.874 | 2.124 |
| 1.234999999999911 | 1.589 | 1.878 | 2.127 |
| 1.239999999999911 | 1.593 | 1.881 | 2.13 |
| 1.244999999999911 | 1.597 | 1.884 | 2.133 |
| 1.249999999999911 | 1.601 | 1.887 | 2.136 |
| 1.254999999999911 | 1.605 | 1.891 | 2.139 |
| 1.259999999999911 | 1.609 | 1.894 | 2.142 |
| 1.264999999999911 | 1.613 | 1.897 | 2.145 |
| 1.269999999999911 | 1.616 | 1.901 | 2.148 |
| 1.27499999999991 | 1.62 | 1.904 | 2.151 |
| 1.27999999999991 | 1.624 | 1.907 | 2.154 |
| 1.28499999999991 | 1.628 | 1.911 | 2.157 |
| 1.28999999999991 | 1.632 | 1.914 | 2.16 |
| 1.29499999999991 | 1.636 | 1.918 | 2.163 |
| 1.29999999999991 | 1.64 | 1.921 | 2.166 |
| 1.30499999999991 | 1.644 | 1.924 | 2.169 |
| 1.30999999999991 | 1.648 | 1.928 | 2.172 |
| 1.31499999999991 | 1.652 | 1.931 | 2.175 |
| 1.319999999999909 | 1.656 | 1.935 | 2.178 |
| 1.324999999999909 | 1.66 | 1.938 | 2.181 |
| 1.329999999999909 | 1.664 | 1.941 | 2.184 |
| 1.334999999999909 | 1.668 | 1.945 | 2.187 |
| 1.339999999999909 | 1.672 | 1.948 | 2.19 |
| 1.344999999999909 | 1.676 | 1.952 | 2.193 |
| 1.349999999999909 | 1.68 | 1.955 | 2.196 |
| 1.354999999999909 | 1.684 | 1.959 | 2.199 |
| 1.359999999999909 | 1.688 | 1.962 | 2.202 |
| 1.364999999999908 | 1.692 | 1.966 | 2.205 |
| 1.369999999999908 | 1.696 | 1.969 | 2.208 |
| 1.374999999999908 | 1.7 | 1.972 | 2.211 |
| 1.379999999999908 | 1.704 | 1.976 | 2.215 |
| 1.384999999999908 | 1.708 | 1.979 | 2.218 |
| 1.389999999999908 | 1.712 | 1.983 | 2.221 |
| 1.394999999999908 | 1.716 | 1.986 | 2.224 |
| 1.399999999999908 | 1.72 | 1.99 | 2.227 |
| 1.404999999999908 | 1.725 | 1.993 | 2.23 |
| 1.409999999999908 | 1.729 | 1.997 | 2.233 |
| 1.414999999999907 | 1.733 | 2.001 | 2.237 |
| 1.419999999999907 | 1.737 | 2.004 | 2.24 |
| 1.424999999999907 | 1.741 | 2.008 | 2.243 |
| 1.429999999999907 | 1.745 | 2.011 | 2.246 |
| 1.434999999999907 | 1.749 | 2.015 | 2.249 |
| 1.439999999999907 | 1.753 | 2.018 | 2.252 |
| 1.444999999999907 | 1.757 | 2.022 | 2.256 |
| 1.449999999999907 | 1.761 | 2.025 | 2.259 |
| 1.454999999999907 | 1.766 | 2.029 | 2.262 |
| 1.459999999999906 | 1.77 | 2.033 | 2.265 |
| 1.464999999999906 | 1.774 | 2.036 | 2.269 |
| 1.469999999999906 | 1.778 | 2.04 | 2.272 |
| 1.474999999999906 | 1.782 | 2.043 | 2.275 |
| 1.479999999999906 | 1.786 | 2.047 | 2.278 |
| 1.484999999999906 | 1.79 | 2.051 | 2.281 |
| 1.489999999999906 | 1.794 | 2.054 | 2.285 |
| 1.494999999999906 | 1.799 | 2.058 | 2.288 |
| 1.499999999999906 | 1.803 | 2.062 | 2.291 |
| 1.504999999999906 | 1.807 | 2.065 | 2.295 |
| 1.509999999999905 | 1.811 | 2.069 | 2.298 |
| 1.514999999999905 | 1.815 | 2.072 | 2.301 |
| 1.519999999999905 | 1.819 | 2.076 | 2.304 |
| 1.524999999999905 | 1.824 | 2.08 | 2.308 |
| 1.529999999999905 | 1.828 | 2.083 | 2.311 |
| 1.534999999999905 | 1.832 | 2.087 | 2.314 |
| 1.539999999999905 | 1.836 | 2.091 | 2.318 |
| 1.544999999999905 | 1.84 | 2.095 | 2.321 |
| 1.549999999999905 | 1.845 | 2.098 | 2.324 |
| 1.554999999999904 | 1.849 | 2.102 | 2.328 |
| 1.559999999999904 | 1.853 | 2.106 | 2.331 |
| 1.564999999999904 | 1.857 | 2.109 | 2.334 |
| 1.569999999999904 | 1.861 | 2.113 | 2.338 |
| 1.574999999999904 | 1.866 | 2.117 | 2.341 |
| 1.579999999999904 | 1.87 | 2.12 | 2.344 |
| 1.584999999999904 | 1.874 | 2.124 | 2.348 |
| 1.589999999999904 | 1.878 | 2.128 | 2.351 |
| 1.594999999999904 | 1.883 | 2.132 | 2.355 |
| 1.599999999999903 | 1.887 | 2.135 | 2.358 |
| 1.604999999999903 | 1.891 | 2.139 | 2.361 |
| 1.609999999999903 | 1.895 | 2.143 | 2.365 |
| 1.614999999999903 | 1.9 | 2.147 | 2.368 |
| 1.619999999999903 | 1.904 | 2.15 | 2.372 |
| 1.624999999999903 | 1.908 | 2.154 | 2.375 |
| 1.629999999999903 | 1.912 | 2.158 | 2.378 |
| 1.634999999999903 | 1.917 | 2.162 | 2.382 |
| 1.639999999999903 | 1.921 | 2.166 | 2.385 |
| 1.644999999999902 | 1.925 | 2.169 | 2.389 |
| 1.649999999999902 | 1.929 | 2.173 | 2.392 |
| 1.654999999999902 | 1.934 | 2.177 | 2.396 |
| 1.659999999999902 | 1.938 | 2.181 | 2.399 |
| 1.664999999999902 | 1.942 | 2.185 | 2.403 |
| 1.669999999999902 | 1.947 | 2.188 | 2.406 |
| 1.674999999999902 | 1.951 | 2.192 | 2.409 |
| 1.679999999999902 | 1.955 | 2.196 | 2.413 |
| 1.684999999999902 | 1.959 | 2.2 | 2.416 |
| 1.689999999999901 | 1.964 | 2.204 | 2.42 |
| 1.694999999999901 | 1.968 | 2.207 | 2.423 |
| 1.699999999999901 | 1.972 | 2.211 | 2.427 |
| 1.704999999999901 | 1.977 | 2.215 | 2.43 |
| 1.709999999999901 | 1.981 | 2.219 | 2.434 |
| 1.714999999999901 | 1.985 | 2.223 | 2.437 |
| 1.719999999999901 | 1.99 | 2.227 | 2.441 |
| 1.724999999999901 | 1.994 | 2.231 | 2.445 |
| 1.729999999999901 | 1.998 | 2.234 | 2.448 |
| 1.734999999999901 | 2.003 | 2.238 | 2.452 |
| 1.7399999999999 | 2.007 | 2.242 | 2.455 |
| 1.7449999999999 | 2.011 | 2.246 | 2.459 |
| 1.7499999999999 | 2.016 | 2.25 | 2.462 |
| 1.7549999999999 | 2.02 | 2.254 | 2.466 |
| 1.7599999999999 | 2.024 | 2.258 | 2.469 |
| 1.7649999999999 | 2.029 | 2.262 | 2.473 |
| 1.7699999999999 | 2.033 | 2.266 | 2.476 |
| 1.7749999999999 | 2.037 | 2.269 | 2.48 |
| 1.7799999999999 | 2.042 | 2.273 | 2.484 |
| 1.784999999999899 | 2.046 | 2.277 | 2.487 |
| 1.789999999999899 | 2.05 | 2.281 | 2.491 |
| 1.794999999999899 | 2.055 | 2.285 | 2.494 |
| 1.799999999999899 | 2.059 | 2.289 | 2.498 |
| 1.804999999999899 | 2.063 | 2.293 | 2.502 |
| 1.809999999999899 | 2.068 | 2.297 | 2.505 |
| 1.814999999999899 | 2.072 | 2.301 | 2.509 |
| 1.819999999999899 | 2.077 | 2.305 | 2.512 |
| 1.824999999999899 | 2.081 | 2.309 | 2.516 |
| 1.829999999999899 | 2.085 | 2.313 | 2.52 |
| 1.834999999999898 | 2.09 | 2.317 | 2.523 |
| 1.839999999999898 | 2.094 | 2.321 | 2.527 |
| 1.844999999999898 | 2.099 | 2.325 | 2.531 |
| 1.849999999999898 | 2.103 | 2.329 | 2.534 |
| 1.854999999999898 | 2.107 | 2.333 | 2.538 |
| 1.859999999999898 | 2.112 | 2.337 | 2.542 |
| 1.864999999999898 | 2.116 | 2.341 | 2.545 |
| 1.869999999999898 | 2.121 | 2.345 | 2.549 |
| 1.874999999999898 | 2.125 | 2.349 | 2.553 |
| 1.879999999999897 | 2.129 | 2.353 | 2.556 |
| 1.884999999999897 | 2.134 | 2.357 | 2.56 |
| 1.889999999999897 | 2.138 | 2.361 | 2.564 |
| 1.894999999999897 | 2.143 | 2.365 | 2.567 |
| 1.899999999999897 | 2.147 | 2.369 | 2.571 |
| 1.904999999999897 | 2.152 | 2.373 | 2.575 |
| 1.909999999999897 | 2.156 | 2.377 | 2.578 |
| 1.914999999999897 | 2.16 | 2.381 | 2.582 |
| 1.919999999999897 | 2.165 | 2.385 | 2.586 |
| 1.924999999999897 | 2.169 | 2.389 | 2.59 |
| 1.929999999999896 | 2.174 | 2.393 | 2.593 |
| 1.934999999999896 | 2.178 | 2.397 | 2.597 |
| 1.939999999999896 | 2.183 | 2.401 | 2.601 |
| 1.944999999999896 | 2.187 | 2.405 | 2.604 |
| 1.949999999999896 | 2.191 | 2.409 | 2.608 |
| 1.954999999999896 | 2.196 | 2.413 | 2.612 |
| 1.959999999999896 | 2.2 | 2.417 | 2.616 |
| 1.964999999999896 | 2.205 | 2.421 | 2.619 |
| 1.969999999999896 | 2.209 | 2.425 | 2.623 |
| 1.974999999999895 | 2.214 | 2.429 | 2.627 |
| 1.979999999999895 | 2.218 | 2.433 | 2.631 |
| 1.984999999999895 | 2.223 | 2.437 | 2.634 |
| 1.989999999999895 | 2.227 | 2.441 | 2.638 |
| 1.994999999999895 | 2.232 | 2.445 | 2.642 |
| 1.999999999999895 | 2.236 | 2.449 | 2.646 |
| 2.004999999999895 | 2.241 | 2.454 | 2.65 |
| 2.009999999999895 | 2.245 | 2.458 | 2.653 |
| 2.014999999999895 | 2.249 | 2.462 | 2.657 |
| 2.019999999999895 | 2.254 | 2.466 | 2.661 |
| 2.024999999999895 | 2.258 | 2.47 | 2.665 |
| 2.029999999999895 | 2.263 | 2.474 | 2.669 |
| 2.034999999999894 | 2.267 | 2.478 | 2.672 |
| 2.039999999999894 | 2.272 | 2.482 | 2.676 |
| 2.044999999999894 | 2.276 | 2.486 | 2.68 |
| 2.049999999999894 | 2.281 | 2.49 | 2.684 |
| 2.054999999999894 | 2.285 | 2.495 | 2.688 |
| 2.059999999999894 | 2.29 | 2.499 | 2.691 |
| 2.064999999999894 | 2.294 | 2.503 | 2.695 |
| 2.069999999999894 | 2.299 | 2.507 | 2.699 |
| 2.074999999999894 | 2.303 | 2.511 | 2.703 |
| 2.079999999999893 | 2.308 | 2.515 | 2.707 |
| 2.084999999999893 | 2.312 | 2.519 | 2.711 |
| 2.089999999999893 | 2.317 | 2.524 | 2.714 |
| 2.094999999999893 | 2.321 | 2.528 | 2.718 |
| 2.099999999999893 | 2.326 | 2.532 | 2.722 |
| 2.104999999999893 | 2.33 | 2.536 | 2.726 |
| 2.109999999999893 | 2.335 | 2.54 | 2.73 |
| 2.114999999999893 | 2.339 | 2.544 | 2.734 |
| 2.119999999999893 | 2.344 | 2.548 | 2.738 |
| 2.124999999999893 | 2.349 | 2.553 | 2.741 |
| 2.129999999999892 | 2.353 | 2.557 | 2.745 |
| 2.134999999999892 | 2.358 | 2.561 | 2.749 |
| 2.139999999999892 | 2.362 | 2.565 | 2.753 |
| 2.144999999999892 | 2.367 | 2.569 | 2.757 |
| 2.149999999999892 | 2.371 | 2.573 | 2.761 |
| 2.154999999999892 | 2.376 | 2.578 | 2.765 |
| 2.159999999999892 | 2.38 | 2.582 | 2.769 |
| 2.164999999999892 | 2.385 | 2.586 | 2.773 |
| 2.169999999999892 | 2.389 | 2.59 | 2.776 |
| 2.174999999999891 | 2.394 | 2.594 | 2.78 |
| 2.179999999999891 | 2.398 | 2.599 | 2.784 |
| 2.184999999999891 | 2.403 | 2.603 | 2.788 |
| 2.189999999999891 | 2.408 | 2.607 | 2.792 |
| 2.194999999999891 | 2.412 | 2.611 | 2.796 |
| 2.199999999999891 | 2.417 | 2.615 | 2.8 |
| 2.204999999999891 | 2.421 | 2.62 | 2.804 |
| 2.209999999999891 | 2.426 | 2.624 | 2.808 |
| 2.214999999999891 | 2.43 | 2.628 | 2.812 |
| 2.21999999999989 | 2.435 | 2.632 | 2.816 |
| 2.22499999999989 | 2.439 | 2.636 | 2.82 |
| 2.22999999999989 | 2.444 | 2.641 | 2.824 |
| 2.23499999999989 | 2.449 | 2.645 | 2.828 |
| 2.23999999999989 | 2.453 | 2.649 | 2.832 |
| 2.24499999999989 | 2.458 | 2.653 | 2.835 |
| 2.24999999999989 | 2.462 | 2.658 | 2.839 |
| 2.25499999999989 | 2.467 | 2.662 | 2.843 |
| 2.25999999999989 | 2.471 | 2.666 | 2.847 |
| 2.26499999999989 | 2.476 | 2.67 | 2.851 |
| 2.269999999999889 | 2.481 | 2.674 | 2.855 |
| 2.274999999999889 | 2.485 | 2.679 | 2.859 |
| 2.279999999999889 | 2.49 | 2.683 | 2.863 |
| 2.284999999999889 | 2.494 | 2.687 | 2.867 |
| 2.289999999999889 | 2.499 | 2.691 | 2.871 |
| 2.294999999999889 | 2.503 | 2.696 | 2.875 |
| 2.299999999999889 | 2.508 | 2.7 | 2.879 |
| 2.304999999999889 | 2.513 | 2.704 | 2.883 |
| 2.309999999999889 | 2.517 | 2.709 | 2.887 |
| 2.314999999999888 | 2.522 | 2.713 | 2.891 |
| 2.319999999999888 | 2.526 | 2.717 | 2.895 |
| 2.324999999999888 | 2.531 | 2.721 | 2.899 |
| 2.329999999999888 | 2.536 | 2.726 | 2.903 |
| 2.334999999999888 | 2.54 | 2.73 | 2.907 |
| 2.339999999999888 | 2.545 | 2.734 | 2.911 |
| 2.344999999999888 | 2.549 | 2.738 | 2.915 |
| 2.349999999999888 | 2.554 | 2.743 | 2.919 |
| 2.354999999999888 | 2.559 | 2.747 | 2.923 |
| 2.359999999999887 | 2.563 | 2.751 | 2.927 |
| 2.364999999999887 | 2.568 | 2.756 | 2.931 |
| 2.369999999999887 | 2.572 | 2.76 | 2.935 |
| 2.374999999999887 | 2.577 | 2.764 | 2.939 |
| 2.379999999999887 | 2.582 | 2.768 | 2.944 |
| 2.384999999999887 | 2.586 | 2.773 | 2.948 |
| 2.389999999999887 | 2.591 | 2.777 | 2.952 |
| 2.394999999999887 | 2.595 | 2.781 | 2.956 |
| 2.399999999999887 | 2.6 | 2.786 | 2.96 |
| 2.404999999999887 | 2.605 | 2.79 | 2.964 |
| 2.409999999999886 | 2.609 | 2.794 | 2.968 |
| 2.414999999999886 | 2.614 | 2.799 | 2.972 |
| 2.419999999999886 | 2.618 | 2.803 | 2.976 |
| 2.424999999999886 | 2.623 | 2.807 | 2.98 |
| 2.429999999999886 | 2.628 | 2.812 | 2.984 |
| 2.434999999999886 | 2.632 | 2.816 | 2.988 |
| 2.439999999999886 | 2.637 | 2.82 | 2.992 |
| 2.444999999999886 | 2.642 | 2.825 | 2.996 |
| 2.449999999999886 | 2.646 | 2.829 | 3 |
| 2.454999999999885 | 2.651 | 2.833 | 3.005 |
| 2.459999999999885 | 2.655 | 2.838 | 3.009 |
| 2.464999999999885 | 2.66 | 2.842 | 3.013 |
| 2.469999999999885 | 2.665 | 2.846 | 3.017 |
| 2.474999999999885 | 2.669 | 2.851 | 3.021 |
| 2.479999999999885 | 2.674 | 2.855 | 3.025 |
| 2.484999999999885 | 2.679 | 2.859 | 3.029 |
| 2.489999999999885 | 2.683 | 2.864 | 3.033 |
| 2.494999999999885 | 2.688 | 2.868 | 3.037 |
| 2.499999999999884 | 2.693 | 2.872 | 3.041 |
| 2.504999999999884 | 2.697 | 2.877 | 3.045 |
| 2.509999999999884 | 2.702 | 2.881 | 3.05 |
| 2.514999999999884 | 2.707 | 2.885 | 3.054 |
| 2.519999999999884 | 2.711 | 2.89 | 3.058 |
| 2.524999999999884 | 2.716 | 2.894 | 3.062 |
| 2.529999999999884 | 2.72 | 2.898 | 3.066 |
| 2.534999999999884 | 2.725 | 2.903 | 3.07 |
| 2.539999999999884 | 2.73 | 2.907 | 3.074 |
| 2.544999999999884 | 2.734 | 2.912 | 3.078 |
| 2.549999999999883 | 2.739 | 2.916 | 3.083 |
| 2.554999999999883 | 2.744 | 2.92 | 3.087 |
| 2.559999999999883 | 2.748 | 2.925 | 3.091 |
| 2.564999999999883 | 2.753 | 2.929 | 3.095 |
| 2.569999999999883 | 2.758 | 2.933 | 3.099 |
| 2.574999999999883 | 2.762 | 2.938 | 3.103 |
| 2.579999999999883 | 2.767 | 2.942 | 3.107 |
| 2.584999999999883 | 2.772 | 2.947 | 3.112 |
| 2.589999999999883 | 2.776 | 2.951 | 3.116 |
| 2.594999999999882 | 2.781 | 2.955 | 3.12 |
| 2.599999999999882 | 2.786 | 2.96 | 3.124 |
| 2.604999999999882 | 2.79 | 2.964 | 3.128 |
| 2.609999999999882 | 2.795 | 2.969 | 3.132 |
| 2.614999999999882 | 2.8 | 2.973 | 3.137 |
| 2.619999999999882 | 2.804 | 2.977 | 3.141 |
| 2.624999999999882 | 2.809 | 2.982 | 3.145 |
| 2.629999999999882 | 2.814 | 2.986 | 3.149 |
| 2.634999999999882 | 2.818 | 2.991 | 3.153 |
| 2.639999999999881 | 2.823 | 2.995 | 3.157 |
| 2.644999999999881 | 2.828 | 2.999 | 3.162 |
| 2.649999999999881 | 2.832 | 3.004 | 3.166 |
| 2.654999999999881 | 2.837 | 3.008 | 3.17 |
| 2.659999999999881 | 2.842 | 3.013 | 3.174 |
| 2.664999999999881 | 2.846 | 3.017 | 3.178 |
| 2.669999999999881 | 2.851 | 3.021 | 3.183 |
| 2.674999999999881 | 2.856 | 3.026 | 3.187 |
| 2.679999999999881 | 2.86 | 3.03 | 3.191 |
| 2.68499999999988 | 2.865 | 3.035 | 3.195 |
| 2.68999999999988 | 2.87 | 3.039 | 3.199 |
| 2.69499999999988 | 2.875 | 3.044 | 3.204 |
| 2.69999999999988 | 2.879 | 3.048 | 3.208 |
| 2.70499999999988 | 2.884 | 3.052 | 3.212 |
| 2.70999999999988 | 2.889 | 3.057 | 3.216 |
| 2.71499999999988 | 2.893 | 3.061 | 3.22 |
| 2.71999999999988 | 2.898 | 3.066 | 3.225 |
| 2.72499999999988 | 2.903 | 3.07 | 3.229 |
| 2.72999999999988 | 2.907 | 3.075 | 3.233 |
| 2.734999999999879 | 2.912 | 3.079 | 3.237 |
| 2.739999999999879 | 2.917 | 3.083 | 3.242 |
| 2.744999999999879 | 2.921 | 3.088 | 3.246 |
| 2.749999999999879 | 2.926 | 3.092 | 3.25 |
| 2.754999999999879 | 2.931 | 3.097 | 3.254 |
| 2.759999999999879 | 2.936 | 3.101 | 3.258 |
| 2.764999999999879 | 2.94 | 3.106 | 3.263 |
| 2.769999999999879 | 2.945 | 3.11 | 3.267 |
| 2.774999999999879 | 2.95 | 3.115 | 3.271 |
| 2.779999999999878 | 2.954 | 3.119 | 3.275 |
| 2.784999999999878 | 2.959 | 3.123 | 3.28 |
| 2.789999999999878 | 2.964 | 3.128 | 3.284 |
| 2.794999999999878 | 2.969 | 3.132 | 3.288 |
| 2.799999999999878 | 2.973 | 3.137 | 3.292 |
| 2.804999999999878 | 2.978 | 3.141 | 3.297 |
| 2.809999999999878 | 2.983 | 3.146 | 3.301 |
| 2.814999999999878 | 2.987 | 3.15 | 3.305 |
| 2.819999999999878 | 2.992 | 3.155 | 3.309 |
| 2.824999999999878 | 2.997 | 3.159 | 3.314 |
| 2.829999999999877 | 3.001 | 3.164 | 3.318 |
| 2.834999999999877 | 3.006 | 3.168 | 3.322 |
| 2.839999999999877 | 3.011 | 3.173 | 3.326 |
| 2.844999999999877 | 3.016 | 3.177 | 3.331 |
| 2.849999999999877 | 3.02 | 3.182 | 3.335 |
| 2.854999999999877 | 3.025 | 3.186 | 3.339 |
| 2.859999999999877 | 3.03 | 3.191 | 3.344 |
| 2.864999999999877 | 3.035 | 3.195 | 3.348 |
| 2.869999999999877 | 3.039 | 3.2 | 3.352 |
| 2.874999999999876 | 3.044 | 3.204 | 3.356 |
| 2.879999999999876 | 3.049 | 3.208 | 3.361 |
| 2.884999999999876 | 3.053 | 3.213 | 3.365 |
| 2.889999999999876 | 3.058 | 3.217 | 3.369 |
| 2.894999999999876 | 3.063 | 3.222 | 3.374 |
| 2.899999999999876 | 3.068 | 3.226 | 3.378 |
| 2.904999999999876 | 3.072 | 3.231 | 3.382 |
| 2.909999999999876 | 3.077 | 3.235 | 3.386 |
| 2.914999999999876 | 3.082 | 3.24 | 3.391 |
| 2.919999999999876 | 3.086 | 3.244 | 3.395 |
| 2.924999999999875 | 3.091 | 3.249 | 3.399 |
| 2.929999999999875 | 3.096 | 3.253 | 3.404 |
| 2.934999999999875 | 3.101 | 3.258 | 3.408 |
| 2.939999999999875 | 3.105 | 3.262 | 3.412 |
| 2.944999999999875 | 3.11 | 3.267 | 3.417 |
| 2.949999999999875 | 3.115 | 3.271 | 3.421 |
| 2.954999999999875 | 3.12 | 3.276 | 3.425 |
| 2.959999999999875 | 3.124 | 3.28 | 3.43 |
| 2.964999999999875 | 3.129 | 3.285 | 3.434 |
| 2.969999999999874 | 3.134 | 3.29 | 3.438 |
| 2.974999999999874 | 3.139 | 3.294 | 3.442 |
| 2.979999999999874 | 3.143 | 3.299 | 3.447 |
| 2.984999999999874 | 3.148 | 3.303 | 3.451 |
| 2.989999999999874 | 3.153 | 3.308 | 3.455 |
| 2.994999999999874 | 3.158 | 3.312 | 3.46 |
| 2.999999999999874 | 3.162 | 3.317 | 3.464 |
| 3.004999999999874 | 3.167 | 3.321 | 3.468 |
| 3.009999999999874 | 3.172 | 3.326 | 3.473 |
| 3.014999999999874 | 3.177 | 3.33 | 3.477 |
| 3.019999999999873 | 3.181 | 3.335 | 3.481 |
| 3.024999999999873 | 3.186 | 3.339 | 3.486 |
| 3.029999999999873 | 3.191 | 3.344 | 3.49 |
| 3.034999999999873 | 3.196 | 3.348 | 3.494 |
| 3.039999999999873 | 3.2 | 3.353 | 3.499 |
| 3.044999999999873 | 3.205 | 3.357 | 3.503 |
| 3.049999999999873 | 3.21 | 3.362 | 3.507 |
| 3.054999999999873 | 3.215 | 3.366 | 3.512 |
| 3.059999999999873 | 3.219 | 3.371 | 3.516 |
| 3.064999999999872 | 3.224 | 3.376 | 3.521 |
| 3.069999999999872 | 3.229 | 3.38 | 3.525 |
| 3.074999999999872 | 3.234 | 3.385 | 3.529 |
| 3.079999999999872 | 3.238 | 3.389 | 3.534 |
| 3.084999999999872 | 3.243 | 3.394 | 3.538 |
| 3.089999999999872 | 3.248 | 3.398 | 3.542 |
| 3.094999999999872 | 3.253 | 3.403 | 3.547 |
| 3.099999999999872 | 3.257 | 3.407 | 3.551 |
| 3.104999999999872 | 3.262 | 3.412 | 3.555 |
| 3.109999999999872 | 3.267 | 3.416 | 3.56 |
| 3.114999999999871 | 3.272 | 3.421 | 3.564 |
| 3.119999999999871 | 3.276 | 3.426 | 3.569 |
| 3.124999999999871 | 3.281 | 3.43 | 3.573 |
| 3.129999999999871 | 3.286 | 3.435 | 3.577 |
| 3.134999999999871 | 3.291 | 3.439 | 3.582 |
| 3.139999999999871 | 3.295 | 3.444 | 3.586 |
| 3.144999999999871 | 3.3 | 3.448 | 3.59 |
| 3.149999999999871 | 3.305 | 3.453 | 3.595 |
| 3.154999999999871 | 3.31 | 3.457 | 3.599 |
| 3.15999999999987 | 3.314 | 3.462 | 3.604 |
| 3.16499999999987 | 3.319 | 3.467 | 3.608 |
| 3.16999999999987 | 3.324 | 3.471 | 3.612 |
| 3.17499999999987 | 3.329 | 3.476 | 3.617 |
| 3.17999999999987 | 3.334 | 3.48 | 3.621 |
| 3.18499999999987 | 3.338 | 3.485 | 3.625 |
| 3.18999999999987 | 3.343 | 3.489 | 3.63 |
| 3.19499999999987 | 3.348 | 3.494 | 3.634 |
| 3.19999999999987 | 3.353 | 3.499 | 3.639 |
| 3.204999999999869 | 3.357 | 3.503 | 3.643 |
| 3.209999999999869 | 3.362 | 3.508 | 3.647 |
| 3.214999999999869 | 3.367 | 3.512 | 3.652 |
| 3.219999999999869 | 3.372 | 3.517 | 3.656 |
| 3.224999999999869 | 3.376 | 3.521 | 3.661 |
| 3.229999999999869 | 3.381 | 3.526 | 3.665 |
| 3.234999999999869 | 3.386 | 3.531 | 3.669 |
| 3.239999999999869 | 3.391 | 3.535 | 3.674 |
| 3.244999999999869 | 3.396 | 3.54 | 3.678 |
| 3.249999999999869 | 3.4 | 3.544 | 3.683 |
| 3.254999999999868 | 3.405 | 3.549 | 3.687 |
| 3.259999999999868 | 3.41 | 3.554 | 3.692 |
| 3.264999999999868 | 3.415 | 3.558 | 3.696 |
| 3.269999999999868 | 3.419 | 3.563 | 3.7 |
| 3.274999999999868 | 3.424 | 3.567 | 3.705 |
| 3.279999999999868 | 3.429 | 3.572 | 3.709 |
| 3.284999999999868 | 3.434 | 3.576 | 3.714 |
| 3.289999999999868 | 3.439 | 3.581 | 3.718 |
| 3.294999999999868 | 3.443 | 3.586 | 3.723 |
| 3.299999999999867 | 3.448 | 3.59 | 3.727 |
| 3.304999999999867 | 3.453 | 3.595 | 3.731 |
| 3.309999999999867 | 3.458 | 3.599 | 3.736 |
| 3.314999999999867 | 3.463 | 3.604 | 3.74 |
| 3.319999999999867 | 3.467 | 3.609 | 3.745 |
| 3.324999999999867 | 3.472 | 3.613 | 3.749 |
| 3.329999999999867 | 3.477 | 3.618 | 3.754 |
| 3.334999999999867 | 3.482 | 3.622 | 3.758 |
| 3.339999999999867 | 3.486 | 3.627 | 3.762 |
| 3.344999999999866 | 3.491 | 3.632 | 3.767 |
| 3.349999999999866 | 3.496 | 3.636 | 3.771 |
| 3.354999999999866 | 3.501 | 3.641 | 3.776 |
| 3.359999999999866 | 3.506 | 3.645 | 3.78 |
| 3.364999999999866 | 3.51 | 3.65 | 3.785 |
| 3.369999999999866 | 3.515 | 3.655 | 3.789 |
| 3.374999999999866 | 3.52 | 3.659 | 3.793 |
| 3.379999999999866 | 3.525 | 3.664 | 3.798 |
| 3.384999999999866 | 3.53 | 3.669 | 3.802 |
| 3.389999999999866 | 3.534 | 3.673 | 3.807 |
| 3.394999999999865 | 3.539 | 3.678 | 3.811 |
| 3.399999999999865 | 3.544 | 3.682 | 3.816 |
| 3.404999999999865 | 3.549 | 3.687 | 3.82 |
| 3.409999999999865 | 3.554 | 3.692 | 3.825 |
| 3.414999999999865 | 3.558 | 3.696 | 3.829 |
| 3.419999999999865 | 3.563 | 3.701 | 3.834 |
| 3.424999999999865 | 3.568 | 3.705 | 3.838 |
| 3.429999999999865 | 3.573 | 3.71 | 3.843 |
| 3.434999999999865 | 3.578 | 3.715 | 3.847 |
| 3.439999999999864 | 3.582 | 3.719 | 3.851 |
| 3.444999999999864 | 3.587 | 3.724 | 3.856 |
| 3.449999999999864 | 3.592 | 3.729 | 3.86 |
| 3.454999999999864 | 3.597 | 3.733 | 3.865 |
| 3.459999999999864 | 3.602 | 3.738 | 3.869 |
| 3.464999999999864 | 3.606 | 3.742 | 3.874 |
| 3.469999999999864 | 3.611 | 3.747 | 3.878 |
| 3.474999999999864 | 3.616 | 3.752 | 3.883 |
| 3.479999999999864 | 3.621 | 3.756 | 3.887 |
| 3.484999999999864 | 3.626 | 3.761 | 3.892 |
| 3.489999999999863 | 3.63 | 3.766 | 3.896 |
| 3.494999999999863 | 3.635 | 3.77 | 3.901 |
| 3.499999999999863 | 3.64 | 3.775 | 3.905 |
| 3.504999999999863 | 3.645 | 3.78 | 3.91 |
| 3.509999999999863 | 3.65 | 3.784 | 3.914 |
| 3.514999999999863 | 3.654 | 3.789 | 3.919 |
| 3.519999999999863 | 3.659 | 3.793 | 3.923 |
| 3.524999999999863 | 3.664 | 3.798 | 3.928 |
| 3.529999999999863 | 3.669 | 3.803 | 3.932 |
| 3.534999999999862 | 3.674 | 3.807 | 3.937 |
| 3.539999999999862 | 3.679 | 3.812 | 3.941 |
| 3.544999999999862 | 3.683 | 3.817 | 3.946 |
| 3.549999999999862 | 3.688 | 3.821 | 3.95 |
| 3.554999999999862 | 3.693 | 3.826 | 3.954 |
| 3.559999999999862 | 3.698 | 3.831 | 3.959 |
| 3.564999999999862 | 3.703 | 3.835 | 3.963 |
| 3.569999999999862 | 3.707 | 3.84 | 3.968 |
| 3.574999999999862 | 3.712 | 3.845 | 3.972 |
| 3.579999999999862 | 3.717 | 3.849 | 3.977 |
| 3.584999999999861 | 3.722 | 3.854 | 3.981 |
| 3.589999999999861 | 3.727 | 3.859 | 3.986 |
| 3.594999999999861 | 3.731 | 3.863 | 3.99 |
| 3.599999999999861 | 3.736 | 3.868 | 3.995 |
| 3.604999999999861 | 3.741 | 3.872 | 4 |
| 3.609999999999861 | 3.746 | 3.877 | 4.004 |
| 3.614999999999861 | 3.751 | 3.882 | 4.009 |
| 3.619999999999861 | 3.756 | 3.886 | 4.013 |
| 3.62499999999986 | 3.76 | 3.891 | 4.018 |
| 3.62999999999986 | 3.765 | 3.896 | 4.022 |
| 3.63499999999986 | 3.77 | 3.9 | 4.027 |
| 3.63999999999986 | 3.775 | 3.905 | 4.031 |
| 3.64499999999986 | 3.78 | 3.91 | 4.036 |
| 3.64999999999986 | 3.785 | 3.914 | 4.04 |
| 3.65499999999986 | 3.789 | 3.919 | 4.045 |
| 3.65999999999986 | 3.794 | 3.924 | 4.049 |
| 3.66499999999986 | 3.799 | 3.928 | 4.054 |
| 3.669999999999859 | 3.804 | 3.933 | 4.058 |
| 3.674999999999859 | 3.809 | 3.938 | 4.063 |
| 3.679999999999859 | 3.813 | 3.942 | 4.067 |
| 3.684999999999859 | 3.818 | 3.947 | 4.072 |
| 3.689999999999859 | 3.823 | 3.952 | 4.076 |
| 3.694999999999859 | 3.828 | 3.956 | 4.081 |
| 3.699999999999859 | 3.833 | 3.961 | 4.085 |
| 3.704999999999859 | 3.838 | 3.966 | 4.09 |
| 3.709999999999859 | 3.842 | 3.97 | 4.094 |
| 3.714999999999859 | 3.847 | 3.975 | 4.099 |
| 3.719999999999858 | 3.852 | 3.98 | 4.103 |
| 3.724999999999858 | 3.857 | 3.984 | 4.108 |
| 3.729999999999858 | 3.862 | 3.989 | 4.113 |
| 3.734999999999858 | 3.867 | 3.994 | 4.117 |
| 3.739999999999858 | 3.871 | 3.998 | 4.122 |
| 3.744999999999858 | 3.876 | 4.003 | 4.126 |
| 3.749999999999858 | 3.881 | 4.008 | 4.131 |
| 3.754999999999858 | 3.886 | 4.012 | 4.135 |
| 3.759999999999858 | 3.891 | 4.017 | 4.14 |
| 3.764999999999857 | 3.896 | 4.022 | 4.144 |
| 3.769999999999857 | 3.9 | 4.027 | 4.149 |
| 3.774999999999857 | 3.905 | 4.031 | 4.153 |
| 3.779999999999857 | 3.91 | 4.036 | 4.158 |
| 3.784999999999857 | 3.915 | 4.041 | 4.162 |
| 3.789999999999857 | 3.92 | 4.045 | 4.167 |
| 3.794999999999857 | 3.925 | 4.05 | 4.172 |
| 3.799999999999857 | 3.929 | 4.055 | 4.176 |
| 3.804999999999857 | 3.934 | 4.059 | 4.181 |
| 3.809999999999857 | 3.939 | 4.064 | 4.185 |
| 3.814999999999856 | 3.944 | 4.069 | 4.19 |
| 3.819999999999856 | 3.949 | 4.073 | 4.194 |
| 3.824999999999856 | 3.954 | 4.078 | 4.199 |
| 3.829999999999856 | 3.958 | 4.083 | 4.203 |
| 3.834999999999856 | 3.963 | 4.087 | 4.208 |
| 3.839999999999856 | 3.968 | 4.092 | 4.213 |
| 3.844999999999856 | 3.973 | 4.097 | 4.217 |
| 3.849999999999856 | 3.978 | 4.102 | 4.222 |
| 3.854999999999856 | 3.983 | 4.106 | 4.226 |
| 3.859999999999855 | 3.987 | 4.111 | 4.231 |
| 3.864999999999855 | 3.992 | 4.116 | 4.235 |
| 3.869999999999855 | 3.997 | 4.12 | 4.24 |
| 3.874999999999855 | 4.002 | 4.125 | 4.244 |
| 3.879999999999855 | 4.007 | 4.13 | 4.249 |
| 3.884999999999855 | 4.012 | 4.134 | 4.254 |
| 3.889999999999855 | 4.016 | 4.139 | 4.258 |
| 3.894999999999855 | 4.021 | 4.144 | 4.263 |
| 3.899999999999855 | 4.026 | 4.148 | 4.267 |
| 3.904999999999855 | 4.031 | 4.153 | 4.272 |
| 3.909999999999854 | 4.036 | 4.158 | 4.276 |
| 3.914999999999854 | 4.041 | 4.163 | 4.281 |
| 3.919999999999854 | 4.046 | 4.167 | 4.286 |
| 3.924999999999854 | 4.05 | 4.172 | 4.29 |
| 3.929999999999854 | 4.055 | 4.177 | 4.295 |
| 3.934999999999854 | 4.06 | 4.181 | 4.299 |
| 3.939999999999854 | 4.065 | 4.186 | 4.304 |
| 3.944999999999854 | 4.07 | 4.191 | 4.308 |
| 3.949999999999854 | 4.075 | 4.196 | 4.313 |
| 3.954999999999853 | 4.079 | 4.2 | 4.318 |
| 3.959999999999853 | 4.084 | 4.205 | 4.322 |
| 3.964999999999853 | 4.089 | 4.21 | 4.327 |
| 3.969999999999853 | 4.094 | 4.214 | 4.331 |
| 3.974999999999853 | 4.099 | 4.219 | 4.336 |
| 3.979999999999853 | 4.104 | 4.224 | 4.341 |
| 3.984999999999853 | 4.109 | 4.229 | 4.345 |
| 3.989999999999853 | 4.113 | 4.233 | 4.35 |
| 3.994999999999853 | 4.118 | 4.238 | 4.354 |
| 3.999999999999853 | 4.123 | 4.243 | 4.359 |
| 4.004999999999852 | 4.128 | 4.247 | 4.363 |
| 4.009999999999852 | 4.133 | 4.252 | 4.368 |
| 4.014999999999852 | 4.138 | 4.257 | 4.373 |
| 4.019999999999852 | 4.143 | 4.262 | 4.377 |
| 4.024999999999852 | 4.147 | 4.266 | 4.382 |
| 4.029999999999852 | 4.152 | 4.271 | 4.386 |
| 4.034999999999852 | 4.157 | 4.276 | 4.391 |
| 4.039999999999851 | 4.162 | 4.28 | 4.396 |
| 4.044999999999852 | 4.167 | 4.285 | 4.4 |
| 4.049999999999851 | 4.172 | 4.29 | 4.405 |
| 4.054999999999851 | 4.176 | 4.295 | 4.409 |
| 4.059999999999851 | 4.181 | 4.299 | 4.414 |
| 4.064999999999851 | 4.186 | 4.304 | 4.419 |
| 4.069999999999851 | 4.191 | 4.309 | 4.423 |
| 4.074999999999851 | 4.196 | 4.313 | 4.428 |
| 4.07999999999985 | 4.201 | 4.318 | 4.432 |
| 4.084999999999851 | 4.206 | 4.323 | 4.437 |
| 4.08999999999985 | 4.21 | 4.328 | 4.442 |
| 4.094999999999851 | 4.215 | 4.332 | 4.446 |
| 4.09999999999985 | 4.22 | 4.337 | 4.451 |
| 4.10499999999985 | 4.225 | 4.342 | 4.455 |
| 4.10999999999985 | 4.23 | 4.347 | 4.46 |
| 4.11499999999985 | 4.235 | 4.351 | 4.465 |
| 4.11999999999985 | 4.24 | 4.356 | 4.469 |
| 4.12499999999985 | 4.244 | 4.361 | 4.474 |
| 4.12999999999985 | 4.249 | 4.365 | 4.478 |
| 4.13499999999985 | 4.254 | 4.37 | 4.483 |
| 4.13999999999985 | 4.259 | 4.375 | 4.488 |
| 4.144999999999849 | 4.264 | 4.38 | 4.492 |
| 4.14999999999985 | 4.269 | 4.384 | 4.497 |
| 4.154999999999849 | 4.274 | 4.389 | 4.502 |
| 4.15999999999985 | 4.279 | 4.394 | 4.506 |
| 4.164999999999849 | 4.283 | 4.399 | 4.511 |
| 4.169999999999849 | 4.288 | 4.403 | 4.515 |
| 4.174999999999849 | 4.293 | 4.408 | 4.52 |
| 4.179999999999848 | 4.298 | 4.413 | 4.525 |
| 4.184999999999849 | 4.303 | 4.417 | 4.529 |
| 4.189999999999848 | 4.308 | 4.422 | 4.534 |
| 4.194999999999848 | 4.313 | 4.427 | 4.539 |
| 4.199999999999848 | 4.317 | 4.432 | 4.543 |
| 4.204999999999848 | 4.322 | 4.436 | 4.548 |
| 4.209999999999848 | 4.327 | 4.441 | 4.552 |
| 4.214999999999848 | 4.332 | 4.446 | 4.557 |
| 4.219999999999847 | 4.337 | 4.451 | 4.562 |
| 4.224999999999848 | 4.342 | 4.455 | 4.566 |
| 4.229999999999847 | 4.347 | 4.46 | 4.571 |
| 4.234999999999847 | 4.351 | 4.465 | 4.576 |
| 4.239999999999847 | 4.356 | 4.47 | 4.58 |
| 4.244999999999847 | 4.361 | 4.474 | 4.585 |
| 4.249999999999847 | 4.366 | 4.479 | 4.589 |
| 4.254999999999847 | 4.371 | 4.484 | 4.594 |
| 4.259999999999846 | 4.376 | 4.489 | 4.599 |
| 4.264999999999847 | 4.381 | 4.493 | 4.603 |
| 4.269999999999846 | 4.386 | 4.498 | 4.608 |
| 4.274999999999846 | 4.39 | 4.503 | 4.613 |
| 4.279999999999846 | 4.395 | 4.508 | 4.617 |
| 4.284999999999846 | 4.4 | 4.512 | 4.622 |
| 4.289999999999846 | 4.405 | 4.517 | 4.626 |
| 4.294999999999846 | 4.41 | 4.522 | 4.631 |
| 4.299999999999846 | 4.415 | 4.527 | 4.636 |
| 4.304999999999846 | 4.42 | 4.531 | 4.64 |
| 4.309999999999845 | 4.424 | 4.536 | 4.645 |
| 4.314999999999846 | 4.429 | 4.541 | 4.65 |
| 4.319999999999845 | 4.434 | 4.546 | 4.654 |
| 4.324999999999846 | 4.439 | 4.55 | 4.659 |
| 4.329999999999845 | 4.444 | 4.555 | 4.664 |
| 4.334999999999845 | 4.449 | 4.56 | 4.668 |
| 4.339999999999845 | 4.454 | 4.565 | 4.673 |
| 4.344999999999845 | 4.459 | 4.569 | 4.678 |
| 4.349999999999845 | 4.463 | 4.574 | 4.682 |
| 4.354999999999845 | 4.468 | 4.579 | 4.687 |
| 4.359999999999844 | 4.473 | 4.584 | 4.691 |
| 4.364999999999845 | 4.478 | 4.588 | 4.696 |
| 4.369999999999844 | 4.483 | 4.593 | 4.701 |
| 4.374999999999844 | 4.488 | 4.598 | 4.705 |
| 4.379999999999844 | 4.493 | 4.603 | 4.71 |
| 4.384999999999844 | 4.498 | 4.607 | 4.715 |
| 4.389999999999844 | 4.502 | 4.612 | 4.719 |
| 4.394999999999844 | 4.507 | 4.617 | 4.724 |
| 4.399999999999844 | 4.512 | 4.622 | 4.729 |
| 4.404999999999844 | 4.517 | 4.626 | 4.733 |
| 4.409999999999843 | 4.522 | 4.631 | 4.738 |
| 4.414999999999844 | 4.527 | 4.636 | 4.743 |
| 4.419999999999843 | 4.532 | 4.641 | 4.747 |
| 4.424999999999843 | 4.537 | 4.645 | 4.752 |
| 4.429999999999843 | 4.541 | 4.65 | 4.757 |
| 4.434999999999843 | 4.546 | 4.655 | 4.761 |
| 4.439999999999843 | 4.551 | 4.66 | 4.766 |
| 4.444999999999843 | 4.556 | 4.665 | 4.771 |
| 4.449999999999842 | 4.561 | 4.669 | 4.775 |
| 4.454999999999843 | 4.566 | 4.674 | 4.78 |
| 4.459999999999842 | 4.571 | 4.679 | 4.785 |
| 4.464999999999843 | 4.576 | 4.684 | 4.789 |
| 4.469999999999842 | 4.58 | 4.688 | 4.794 |
| 4.474999999999842 | 4.585 | 4.693 | 4.799 |
| 4.479999999999842 | 4.59 | 4.698 | 4.803 |
| 4.484999999999842 | 4.595 | 4.703 | 4.808 |
| 4.489999999999842 | 4.6 | 4.707 | 4.812 |
| 4.494999999999842 | 4.605 | 4.712 | 4.817 |
| 4.499999999999841 | 4.61 | 4.717 | 4.822 |
| 4.504999999999842 | 4.615 | 4.722 | 4.826 |
| 4.509999999999841 | 4.62 | 4.727 | 4.831 |
| 4.514999999999842 | 4.624 | 4.731 | 4.836 |
| 4.519999999999841 | 4.629 | 4.736 | 4.84 |
| 4.524999999999841 | 4.634 | 4.741 | 4.845 |
| 4.529999999999841 | 4.639 | 4.746 | 4.85 |
| 4.534999999999841 | 4.644 | 4.75 | 4.855 |
| 4.53999999999984 | 4.649 | 4.755 | 4.859 |
| 4.544999999999841 | 4.654 | 4.76 | 4.864 |
| 4.54999999999984 | 4.659 | 4.765 | 4.869 |
| 4.554999999999841 | 4.663 | 4.769 | 4.873 |
| 4.55999999999984 | 4.668 | 4.774 | 4.878 |
| 4.564999999999841 | 4.673 | 4.779 | 4.883 |
| 4.56999999999984 | 4.678 | 4.784 | 4.887 |
| 4.57499999999984 | 4.683 | 4.789 | 4.892 |
| 4.57999999999984 | 4.688 | 4.793 | 4.897 |
| 4.58499999999984 | 4.693 | 4.798 | 4.901 |
| 4.58999999999984 | 4.698 | 4.803 | 4.906 |
| 4.59499999999984 | 4.703 | 4.808 | 4.911 |
| 4.59999999999984 | 4.707 | 4.812 | 4.915 |
| 4.60499999999984 | 4.712 | 4.817 | 4.92 |
| 4.60999999999984 | 4.717 | 4.822 | 4.925 |
| 4.614999999999839 | 4.722 | 4.827 | 4.929 |
| 4.61999999999984 | 4.727 | 4.832 | 4.934 |
| 4.624999999999839 | 4.732 | 4.836 | 4.939 |
| 4.62999999999984 | 4.737 | 4.841 | 4.943 |
| 4.634999999999839 | 4.742 | 4.846 | 4.948 |
| 4.639999999999838 | 4.747 | 4.851 | 4.953 |
| 4.644999999999839 | 4.751 | 4.856 | 4.957 |
| 4.649999999999838 | 4.756 | 4.86 | 4.962 |
| 4.654999999999839 | 4.761 | 4.865 | 4.967 |
| 4.659999999999838 | 4.766 | 4.87 | 4.971 |
| 4.664999999999838 | 4.771 | 4.875 | 4.976 |
| 4.669999999999838 | 4.776 | 4.879 | 4.981 |
| 4.674999999999838 | 4.781 | 4.884 | 4.986 |
| 4.679999999999837 | 4.786 | 4.889 | 4.99 |
| 4.684999999999838 | 4.791 | 4.894 | 4.995 |
| 4.689999999999837 | 4.795 | 4.899 | 5 |
| 4.694999999999838 | 4.8 | 4.903 | 5.004 |
| 4.699999999999837 | 4.805 | 4.908 | 5.009 |
| 4.704999999999837 | 4.81 | 4.913 | 5.014 |
| 4.709999999999837 | 4.815 | 4.918 | 5.018 |
| 4.714999999999837 | 4.82 | 4.923 | 5.023 |
| 4.719999999999837 | 4.825 | 4.927 | 5.028 |
| 4.724999999999837 | 4.83 | 4.932 | 5.032 |
| 4.729999999999836 | 4.835 | 4.937 | 5.037 |
| 4.734999999999836 | 4.839 | 4.942 | 5.042 |
| 4.739999999999836 | 4.844 | 4.946 | 5.047 |
| 4.744999999999836 | 4.849 | 4.951 | 5.051 |
| 4.749999999999836 | 4.854 | 4.956 | 5.056 |
| 4.754999999999836 | 4.859 | 4.961 | 5.061 |
| 4.759999999999836 | 4.864 | 4.966 | 5.065 |
| 4.764999999999836 | 4.869 | 4.97 | 5.07 |
| 4.769999999999836 | 4.874 | 4.975 | 5.075 |
| 4.774999999999835 | 4.879 | 4.98 | 5.079 |
| 4.779999999999835 | 4.883 | 4.985 | 5.084 |
| 4.784999999999835 | 4.888 | 4.99 | 5.089 |
| 4.789999999999835 | 4.893 | 4.994 | 5.094 |
| 4.794999999999835 | 4.898 | 4.999 | 5.098 |
| 4.799999999999835 | 4.903 | 5.004 | 5.103 |
| 4.804999999999835 | 4.908 | 5.009 | 5.108 |
| 4.809999999999835 | 4.913 | 5.014 | 5.112 |
| 4.814999999999835 | 4.918 | 5.018 | 5.117 |
| 4.819999999999835 | 4.923 | 5.023 | 5.122 |
| 4.824999999999835 | 4.928 | 5.028 | 5.126 |
| 4.829999999999834 | 4.932 | 5.033 | 5.131 |
| 4.834999999999834 | 4.937 | 5.038 | 5.136 |
| 4.839999999999834 | 4.942 | 5.042 | 5.141 |
| 4.844999999999834 | 4.947 | 5.047 | 5.145 |
| 4.849999999999834 | 4.952 | 5.052 | 5.15 |
| 4.854999999999834 | 4.957 | 5.057 | 5.155 |
| 4.859999999999834 | 4.962 | 5.062 | 5.159 |
| 4.864999999999834 | 4.967 | 5.066 | 5.164 |
| 4.869999999999834 | 4.972 | 5.071 | 5.169 |
| 4.874999999999834 | 4.977 | 5.076 | 5.174 |
| 4.879999999999833 | 4.981 | 5.081 | 5.178 |
| 4.884999999999834 | 4.986 | 5.086 | 5.183 |
| 4.889999999999833 | 4.991 | 5.09 | 5.188 |
| 4.894999999999833 | 4.996 | 5.095 | 5.192 |
| 4.899999999999833 | 5.001 | 5.1 | 5.197 |
| 4.904999999999833 | 5.006 | 5.105 | 5.202 |
| 4.909999999999833 | 5.011 | 5.11 | 5.207 |
| 4.914999999999833 | 5.016 | 5.114 | 5.211 |
| 4.919999999999832 | 5.021 | 5.119 | 5.216 |
| 4.924999999999833 | 5.025 | 5.124 | 5.221 |
| 4.929999999999832 | 5.03 | 5.129 | 5.225 |
| 4.934999999999832 | 5.035 | 5.134 | 5.23 |
| 4.939999999999832 | 5.04 | 5.138 | 5.235 |
| 4.944999999999832 | 5.045 | 5.143 | 5.24 |
| 4.949999999999832 | 5.05 | 5.148 | 5.244 |
| 4.954999999999832 | 5.055 | 5.153 | 5.249 |
| 4.959999999999832 | 5.06 | 5.158 | 5.254 |
| 4.964999999999832 | 5.065 | 5.162 | 5.258 |
| 4.969999999999831 | 5.07 | 5.167 | 5.263 |
| 4.974999999999831 | 5.075 | 5.172 | 5.268 |
| 4.97999999999983 | 5.079 | 5.177 | 5.273 |
| 4.984999999999831 | 5.084 | 5.182 | 5.277 |
| 4.98999999999983 | 5.089 | 5.187 | 5.282 |
| 4.994999999999831 | 5.094 | 5.191 | 5.287 |
| 4.99999999999983 | 5.099 | 5.196 | 5.292 |